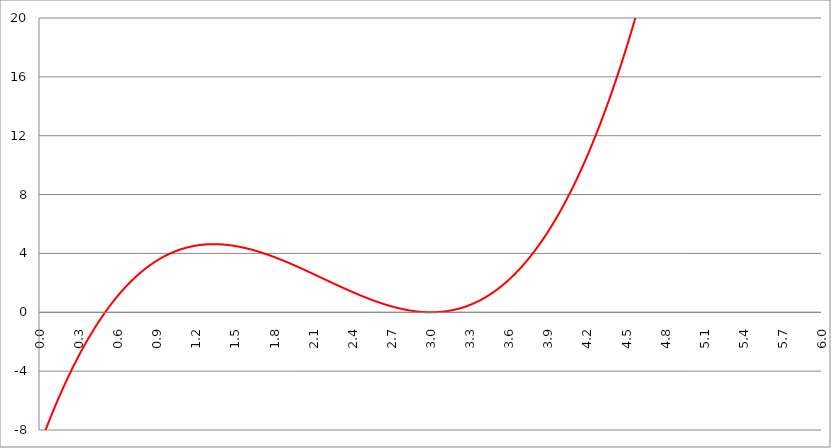
| Category | Series 1 | Series 0 | Series 2 |
|---|---|---|---|
| 0.0 | -9 |  |  |
| 0.003 | -8.928 |  |  |
| 0.006 | -8.856 |  |  |
| 0.009 | -8.785 |  |  |
| 0.012 | -8.714 |  |  |
| 0.015 | -8.643 |  |  |
| 0.018 | -8.572 |  |  |
| 0.021 | -8.502 |  |  |
| 0.024 | -8.431 |  |  |
| 0.027 | -8.361 |  |  |
| 0.03 | -8.292 |  |  |
| 0.033 | -8.222 |  |  |
| 0.036 | -8.153 |  |  |
| 0.039 | -8.084 |  |  |
| 0.042 | -8.015 |  |  |
| 0.045 | -7.946 |  |  |
| 0.048 | -7.878 |  |  |
| 0.051 | -7.81 |  |  |
| 0.054 | -7.742 |  |  |
| 0.057 | -7.674 |  |  |
| 0.06 | -7.606 |  |  |
| 0.063 | -7.539 |  |  |
| 0.066 | -7.472 |  |  |
| 0.069 | -7.405 |  |  |
| 0.072 | -7.339 |  |  |
| 0.075 | -7.272 |  |  |
| 0.078 | -7.206 |  |  |
| 0.081 | -7.14 |  |  |
| 0.084 | -7.075 |  |  |
| 0.087 | -7.009 |  |  |
| 0.09 | -6.944 |  |  |
| 0.093 | -6.879 |  |  |
| 0.096 | -6.814 |  |  |
| 0.099 | -6.749 |  |  |
| 0.102 | -6.685 |  |  |
| 0.105 | -6.621 |  |  |
| 0.108 | -6.557 |  |  |
| 0.111 | -6.493 |  |  |
| 0.114 | -6.43 |  |  |
| 0.117 | -6.367 |  |  |
| 0.12 | -6.304 |  |  |
| 0.123 | -6.241 |  |  |
| 0.126 | -6.178 |  |  |
| 0.129 | -6.116 |  |  |
| 0.132 | -6.054 |  |  |
| 0.135 | -5.992 |  |  |
| 0.138 | -5.93 |  |  |
| 0.141 | -5.869 |  |  |
| 0.144 | -5.808 |  |  |
| 0.147 | -5.747 |  |  |
| 0.15 | -5.686 |  |  |
| 0.153 | -5.625 |  |  |
| 0.156 | -5.565 |  |  |
| 0.159 | -5.505 |  |  |
| 0.162 | -5.445 |  |  |
| 0.165 | -5.385 |  |  |
| 0.168 | -5.325 |  |  |
| 0.171 | -5.266 |  |  |
| 0.174 | -5.207 |  |  |
| 0.177 | -5.148 |  |  |
| 0.18 | -5.09 |  |  |
| 0.183 | -5.031 |  |  |
| 0.186 | -4.973 |  |  |
| 0.189 | -4.915 |  |  |
| 0.192 | -4.857 |  |  |
| 0.195 | -4.799 |  |  |
| 0.198 | -4.742 |  |  |
| 0.201 | -4.685 |  |  |
| 0.204 | -4.628 |  |  |
| 0.207 | -4.571 |  |  |
| 0.21 | -4.515 |  |  |
| 0.213 | -4.458 |  |  |
| 0.216 | -4.402 |  |  |
| 0.219 | -4.346 |  |  |
| 0.222 | -4.291 |  |  |
| 0.225 | -4.235 |  |  |
| 0.228 | -4.18 |  |  |
| 0.231 | -4.125 |  |  |
| 0.234 | -4.07 |  |  |
| 0.237 | -4.016 |  |  |
| 0.24 | -3.961 |  |  |
| 0.243 | -3.907 |  |  |
| 0.246 | -3.853 |  |  |
| 0.249 | -3.799 |  |  |
| 0.252 | -3.746 |  |  |
| 0.255 | -3.692 |  |  |
| 0.258 | -3.639 |  |  |
| 0.261 | -3.586 |  |  |
| 0.264 | -3.533 |  |  |
| 0.267 | -3.481 |  |  |
| 0.27 | -3.428 |  |  |
| 0.273 | -3.376 |  |  |
| 0.276 | -3.324 |  |  |
| 0.279 | -3.272 |  |  |
| 0.282 | -3.221 |  |  |
| 0.285 | -3.17 |  |  |
| 0.288 | -3.118 |  |  |
| 0.291 | -3.068 |  |  |
| 0.294 | -3.017 |  |  |
| 0.297 | -2.966 |  |  |
| 0.3 | -2.916 |  |  |
| 0.303 | -2.866 |  |  |
| 0.306 | -2.816 |  |  |
| 0.309 | -2.766 |  |  |
| 0.312 | -2.717 |  |  |
| 0.315 | -2.667 |  |  |
| 0.318 | -2.618 |  |  |
| 0.321 | -2.569 |  |  |
| 0.324 | -2.521 |  |  |
| 0.327 | -2.472 |  |  |
| 0.33 | -2.424 |  |  |
| 0.333 | -2.376 |  |  |
| 0.336 | -2.328 |  |  |
| 0.339 | -2.28 |  |  |
| 0.342 | -2.233 |  |  |
| 0.345 | -2.185 |  |  |
| 0.348 | -2.138 |  |  |
| 0.351 | -2.091 |  |  |
| 0.354 | -2.044 |  |  |
| 0.357 | -1.998 |  |  |
| 0.36 | -1.951 |  |  |
| 0.363 | -1.905 |  |  |
| 0.366 | -1.859 |  |  |
| 0.369 | -1.814 |  |  |
| 0.372 | -1.768 |  |  |
| 0.375 | -1.723 |  |  |
| 0.378 | -1.677 |  |  |
| 0.381 | -1.632 |  |  |
| 0.384 | -1.588 |  |  |
| 0.387 | -1.543 |  |  |
| 0.39 | -1.499 |  |  |
| 0.393 | -1.454 |  |  |
| 0.396 | -1.41 |  |  |
| 0.399 | -1.367 |  |  |
| 0.402 | -1.323 |  |  |
| 0.405 | -1.279 |  |  |
| 0.408 | -1.236 |  |  |
| 0.411 | -1.193 |  |  |
| 0.414 | -1.15 |  |  |
| 0.417 | -1.108 |  |  |
| 0.42 | -1.065 |  |  |
| 0.423 | -1.023 |  |  |
| 0.426 | -0.981 |  |  |
| 0.429 | -0.939 |  |  |
| 0.432 | -0.897 |  |  |
| 0.435 | -0.855 |  |  |
| 0.438 | -0.814 |  |  |
| 0.441 | -0.773 |  |  |
| 0.444 | -0.732 |  |  |
| 0.447 | -0.691 |  |  |
| 0.45 | -0.65 |  |  |
| 0.453 | -0.61 |  |  |
| 0.456 | -0.57 |  |  |
| 0.459 | -0.529 |  |  |
| 0.462 | -0.49 |  |  |
| 0.465 | -0.45 |  |  |
| 0.468 | -0.41 |  |  |
| 0.471 | -0.371 |  |  |
| 0.474 | -0.332 |  |  |
| 0.477 | -0.293 |  |  |
| 0.48 | -0.254 |  |  |
| 0.483 | -0.215 |  |  |
| 0.486 | -0.177 |  |  |
| 0.489 | -0.139 |  |  |
| 0.492 | -0.101 |  |  |
| 0.495 | -0.063 |  |  |
| 0.498 | -0.025 |  |  |
| 0.501 | 0.012 |  |  |
| 0.504 | 0.05 |  |  |
| 0.507 | 0.087 |  |  |
| 0.51 | 0.124 |  |  |
| 0.513 | 0.161 |  |  |
| 0.516 | 0.197 |  |  |
| 0.519 | 0.234 |  |  |
| 0.522 | 0.27 |  |  |
| 0.525 | 0.306 |  |  |
| 0.528 | 0.342 |  |  |
| 0.531 | 0.378 |  |  |
| 0.534 | 0.414 |  |  |
| 0.537 | 0.449 |  |  |
| 0.54 | 0.484 |  |  |
| 0.543 | 0.519 |  |  |
| 0.546 | 0.554 |  |  |
| 0.549 | 0.589 |  |  |
| 0.552 | 0.623 |  |  |
| 0.555 | 0.658 |  |  |
| 0.558 | 0.692 |  |  |
| 0.561 | 0.726 |  |  |
| 0.564 | 0.76 |  |  |
| 0.567 | 0.793 |  |  |
| 0.57 | 0.827 |  |  |
| 0.573 | 0.86 |  |  |
| 0.576 | 0.893 |  |  |
| 0.579 | 0.926 |  |  |
| 0.582 | 0.959 |  |  |
| 0.585 | 0.991 |  |  |
| 0.588 | 1.024 |  |  |
| 0.591 | 1.056 |  |  |
| 0.594 | 1.088 |  |  |
| 0.597 | 1.12 |  |  |
| 0.6 | 1.152 |  |  |
| 0.603 | 1.184 |  |  |
| 0.606 | 1.215 |  |  |
| 0.609 | 1.246 |  |  |
| 0.612 | 1.277 |  |  |
| 0.615 | 1.308 |  |  |
| 0.618 | 1.339 |  |  |
| 0.621 | 1.37 |  |  |
| 0.624 | 1.4 |  |  |
| 0.627 | 1.43 |  |  |
| 0.63 | 1.46 |  |  |
| 0.633 | 1.49 |  |  |
| 0.636 | 1.52 |  |  |
| 0.639 | 1.55 |  |  |
| 0.642 | 1.579 |  |  |
| 0.645 | 1.608 |  |  |
| 0.648 | 1.637 |  |  |
| 0.651 | 1.666 |  |  |
| 0.654 | 1.695 |  |  |
| 0.657 | 1.724 |  |  |
| 0.66 | 1.752 |  |  |
| 0.663 | 1.78 |  |  |
| 0.666 | 1.809 |  |  |
| 0.669 | 1.837 |  |  |
| 0.672 | 1.864 |  |  |
| 0.675 | 1.892 |  |  |
| 0.678 | 1.919 |  |  |
| 0.681 | 1.947 |  |  |
| 0.684 | 1.974 |  |  |
| 0.687 | 2.001 |  |  |
| 0.69 | 2.028 |  |  |
| 0.693 | 2.054 |  |  |
| 0.696 | 2.081 |  |  |
| 0.699 | 2.107 |  |  |
| 0.702 | 2.133 |  |  |
| 0.705 | 2.159 |  |  |
| 0.708 | 2.185 |  |  |
| 0.711 | 2.211 |  |  |
| 0.714 | 2.237 |  |  |
| 0.717 | 2.262 |  |  |
| 0.72 | 2.287 |  |  |
| 0.723 | 2.312 |  |  |
| 0.726 | 2.337 |  |  |
| 0.729 | 2.362 |  |  |
| 0.732 | 2.387 |  |  |
| 0.735 | 2.411 |  |  |
| 0.738 | 2.436 |  |  |
| 0.741 | 2.46 |  |  |
| 0.744 | 2.484 |  |  |
| 0.747 | 2.508 |  |  |
| 0.75 | 2.531 |  |  |
| 0.753 | 2.555 |  |  |
| 0.756 | 2.578 |  |  |
| 0.759 | 2.601 |  |  |
| 0.762 | 2.625 |  |  |
| 0.765 | 2.647 |  |  |
| 0.768 | 2.67 |  |  |
| 0.771000000000001 | 2.693 |  |  |
| 0.774000000000001 | 2.715 |  |  |
| 0.777000000000001 | 2.738 |  |  |
| 0.78 | 2.76 |  |  |
| 0.783000000000001 | 2.782 |  |  |
| 0.786000000000001 | 2.804 |  |  |
| 0.789000000000001 | 2.826 |  |  |
| 0.792000000000001 | 2.847 |  |  |
| 0.795000000000001 | 2.869 |  |  |
| 0.798000000000001 | 2.89 |  |  |
| 0.801000000000001 | 2.911 |  |  |
| 0.804000000000001 | 2.932 |  |  |
| 0.807000000000001 | 2.953 |  |  |
| 0.810000000000001 | 2.974 |  |  |
| 0.813000000000001 | 2.994 |  |  |
| 0.816000000000001 | 3.015 |  |  |
| 0.819000000000001 | 3.035 |  |  |
| 0.822000000000001 | 3.055 |  |  |
| 0.825000000000001 | 3.075 |  |  |
| 0.828000000000001 | 3.095 |  |  |
| 0.831000000000001 | 3.114 |  |  |
| 0.834000000000001 | 3.134 |  |  |
| 0.837000000000001 | 3.153 |  |  |
| 0.840000000000001 | 3.173 |  |  |
| 0.843000000000001 | 3.192 |  |  |
| 0.846000000000001 | 3.211 |  |  |
| 0.849000000000001 | 3.23 |  |  |
| 0.852000000000001 | 3.248 |  |  |
| 0.855000000000001 | 3.267 |  |  |
| 0.858000000000001 | 3.285 |  |  |
| 0.861000000000001 | 3.303 |  |  |
| 0.864000000000001 | 3.321 |  |  |
| 0.867000000000001 | 3.339 |  |  |
| 0.870000000000001 | 3.357 |  |  |
| 0.873000000000001 | 3.375 |  |  |
| 0.876000000000001 | 3.393 |  |  |
| 0.879000000000001 | 3.41 |  |  |
| 0.882000000000001 | 3.427 |  |  |
| 0.885000000000001 | 3.444 |  |  |
| 0.888000000000001 | 3.461 |  |  |
| 0.891000000000001 | 3.478 |  |  |
| 0.894000000000001 | 3.495 |  |  |
| 0.897000000000001 | 3.512 |  |  |
| 0.900000000000001 | 3.528 |  |  |
| 0.903000000000001 | 3.544 |  |  |
| 0.906000000000001 | 3.56 |  |  |
| 0.909000000000001 | 3.577 |  |  |
| 0.912000000000001 | 3.592 |  |  |
| 0.915000000000001 | 3.608 |  |  |
| 0.918000000000001 | 3.624 |  |  |
| 0.921000000000001 | 3.639 |  |  |
| 0.924000000000001 | 3.655 |  |  |
| 0.927000000000001 | 3.67 |  |  |
| 0.930000000000001 | 3.685 |  |  |
| 0.933000000000001 | 3.7 |  |  |
| 0.936000000000001 | 3.715 |  |  |
| 0.939000000000001 | 3.729 |  |  |
| 0.942000000000001 | 3.744 |  |  |
| 0.945000000000001 | 3.758 |  |  |
| 0.948000000000001 | 3.773 |  |  |
| 0.951000000000001 | 3.787 |  |  |
| 0.954000000000001 | 3.801 |  |  |
| 0.957000000000001 | 3.815 |  |  |
| 0.960000000000001 | 3.829 |  |  |
| 0.963000000000001 | 3.842 |  |  |
| 0.966000000000001 | 3.856 |  |  |
| 0.969000000000001 | 3.869 |  |  |
| 0.972000000000001 | 3.882 |  |  |
| 0.975000000000001 | 3.896 |  |  |
| 0.978000000000001 | 3.909 |  |  |
| 0.981000000000001 | 3.921 |  |  |
| 0.984000000000001 | 3.934 |  |  |
| 0.987000000000001 | 3.947 |  |  |
| 0.990000000000001 | 3.959 |  |  |
| 0.993000000000001 | 3.972 |  |  |
| 0.996000000000001 | 3.984 |  |  |
| 0.999000000000001 | 3.996 |  |  |
| 1.002000000000001 | 4.008 |  |  |
| 1.005000000000001 | 4.02 |  |  |
| 1.008 | 4.032 |  |  |
| 1.011 | 4.043 |  |  |
| 1.014 | 4.055 |  |  |
| 1.017 | 4.066 |  |  |
| 1.02 | 4.077 |  |  |
| 1.023 | 4.088 |  |  |
| 1.026 | 4.099 |  |  |
| 1.029 | 4.11 |  |  |
| 1.032 | 4.121 |  |  |
| 1.034999999999999 | 4.132 |  |  |
| 1.037999999999999 | 4.142 |  |  |
| 1.040999999999999 | 4.152 |  |  |
| 1.043999999999999 | 4.163 |  |  |
| 1.046999999999999 | 4.173 |  |  |
| 1.049999999999999 | 4.183 |  |  |
| 1.052999999999999 | 4.193 |  |  |
| 1.055999999999999 | 4.202 |  |  |
| 1.058999999999999 | 4.212 |  |  |
| 1.061999999999998 | 4.222 |  |  |
| 1.064999999999998 | 4.231 |  |  |
| 1.067999999999998 | 4.24 |  |  |
| 1.070999999999998 | 4.249 |  |  |
| 1.073999999999998 | 4.258 |  |  |
| 1.076999999999998 | 4.267 |  |  |
| 1.079999999999998 | 4.276 |  |  |
| 1.082999999999998 | 4.285 |  |  |
| 1.085999999999998 | 4.294 |  |  |
| 1.088999999999998 | 4.302 |  |  |
| 1.091999999999997 | 4.31 |  |  |
| 1.094999999999997 | 4.319 |  |  |
| 1.097999999999997 | 4.327 |  |  |
| 1.100999999999997 | 4.335 |  |  |
| 1.103999999999997 | 4.343 |  |  |
| 1.106999999999997 | 4.35 |  |  |
| 1.109999999999997 | 4.358 |  |  |
| 1.112999999999997 | 4.366 |  |  |
| 1.115999999999997 | 4.373 |  |  |
| 1.118999999999996 | 4.38 |  |  |
| 1.121999999999996 | 4.387 |  |  |
| 1.124999999999996 | 4.395 |  |  |
| 1.127999999999996 | 4.402 |  |  |
| 1.130999999999996 | 4.408 |  |  |
| 1.133999999999996 | 4.415 |  |  |
| 1.136999999999996 | 4.422 |  |  |
| 1.139999999999996 | 4.428 |  |  |
| 1.142999999999996 | 4.435 |  |  |
| 1.145999999999995 | 4.441 |  |  |
| 1.148999999999995 | 4.447 |  |  |
| 1.151999999999995 | 4.453 |  |  |
| 1.154999999999995 | 4.459 |  |  |
| 1.157999999999995 | 4.465 |  |  |
| 1.160999999999995 | 4.471 |  |  |
| 1.163999999999995 | 4.477 |  |  |
| 1.166999999999995 | 4.482 |  |  |
| 1.169999999999995 | 4.488 |  |  |
| 1.172999999999994 | 4.493 |  |  |
| 1.175999999999994 | 4.498 |  |  |
| 1.178999999999994 | 4.503 |  |  |
| 1.181999999999994 | 4.508 |  |  |
| 1.184999999999994 | 4.513 |  |  |
| 1.187999999999994 | 4.518 |  |  |
| 1.190999999999994 | 4.523 |  |  |
| 1.193999999999994 | 4.527 |  |  |
| 1.196999999999994 | 4.532 |  |  |
| 1.199999999999993 | 4.536 |  |  |
| 1.202999999999993 | 4.54 |  |  |
| 1.205999999999993 | 4.544 |  |  |
| 1.208999999999993 | 4.548 |  |  |
| 1.211999999999993 | 4.552 |  |  |
| 1.214999999999993 | 4.556 |  |  |
| 1.217999999999993 | 4.56 |  |  |
| 1.220999999999993 | 4.564 |  |  |
| 1.223999999999993 | 4.567 |  |  |
| 1.226999999999993 | 4.571 |  |  |
| 1.229999999999992 | 4.574 |  |  |
| 1.232999999999992 | 4.577 |  |  |
| 1.235999999999992 | 4.58 |  |  |
| 1.238999999999992 | 4.583 |  |  |
| 1.241999999999992 | 4.586 |  |  |
| 1.244999999999992 | 4.589 |  |  |
| 1.247999999999992 | 4.592 |  |  |
| 1.250999999999992 | 4.595 |  |  |
| 1.253999999999992 | 4.597 |  |  |
| 1.256999999999991 | 4.6 |  |  |
| 1.259999999999991 | 4.602 |  |  |
| 1.262999999999991 | 4.604 |  |  |
| 1.265999999999991 | 4.606 |  |  |
| 1.268999999999991 | 4.608 |  |  |
| 1.271999999999991 | 4.61 |  |  |
| 1.274999999999991 | 4.612 |  |  |
| 1.277999999999991 | 4.614 |  |  |
| 1.280999999999991 | 4.616 |  |  |
| 1.28399999999999 | 4.617 |  |  |
| 1.28699999999999 | 4.619 |  |  |
| 1.28999999999999 | 4.62 |  |  |
| 1.29299999999999 | 4.621 |  |  |
| 1.29599999999999 | 4.623 |  |  |
| 1.29899999999999 | 4.624 |  |  |
| 1.30199999999999 | 4.625 |  |  |
| 1.30499999999999 | 4.626 |  |  |
| 1.30799999999999 | 4.626 |  |  |
| 1.310999999999989 | 4.627 |  |  |
| 1.313999999999989 | 4.628 |  |  |
| 1.316999999999989 | 4.628 |  |  |
| 1.319999999999989 | 4.629 |  |  |
| 1.322999999999989 | 4.629 |  |  |
| 1.325999999999989 | 4.629 |  |  |
| 1.328999999999989 | 4.63 |  |  |
| 1.331999999999989 | 4.63 |  |  |
| 1.334999999999989 | 4.63 |  |  |
| 1.337999999999988 | 4.63 |  |  |
| 1.340999999999988 | 4.629 |  |  |
| 1.343999999999988 | 4.629 |  |  |
| 1.346999999999988 | 4.629 |  |  |
| 1.349999999999988 | 4.628 |  |  |
| 1.352999999999988 | 4.628 |  |  |
| 1.355999999999988 | 4.627 |  |  |
| 1.358999999999988 | 4.626 |  |  |
| 1.361999999999988 | 4.626 |  |  |
| 1.364999999999987 | 4.625 |  |  |
| 1.367999999999987 | 4.624 |  |  |
| 1.370999999999987 | 4.623 |  |  |
| 1.373999999999987 | 4.621 |  |  |
| 1.376999999999987 | 4.62 |  |  |
| 1.379999999999987 | 4.619 |  |  |
| 1.382999999999987 | 4.618 |  |  |
| 1.385999999999987 | 4.616 |  |  |
| 1.388999999999987 | 4.614 |  |  |
| 1.391999999999987 | 4.613 |  |  |
| 1.394999999999986 | 4.611 |  |  |
| 1.397999999999986 | 4.609 |  |  |
| 1.400999999999986 | 4.607 |  |  |
| 1.403999999999986 | 4.605 |  |  |
| 1.406999999999986 | 4.603 |  |  |
| 1.409999999999986 | 4.601 |  |  |
| 1.412999999999986 | 4.599 |  |  |
| 1.415999999999986 | 4.597 |  |  |
| 1.418999999999986 | 4.594 |  |  |
| 1.421999999999985 | 4.592 |  |  |
| 1.424999999999985 | 4.589 |  |  |
| 1.427999999999985 | 4.587 |  |  |
| 1.430999999999985 | 4.584 |  |  |
| 1.433999999999985 | 4.581 |  |  |
| 1.436999999999985 | 4.578 |  |  |
| 1.439999999999985 | 4.575 |  |  |
| 1.442999999999985 | 4.572 |  |  |
| 1.445999999999985 | 4.569 |  |  |
| 1.448999999999984 | 4.566 |  |  |
| 1.451999999999984 | 4.563 |  |  |
| 1.454999999999984 | 4.559 |  |  |
| 1.457999999999984 | 4.556 |  |  |
| 1.460999999999984 | 4.552 |  |  |
| 1.463999999999984 | 4.549 |  |  |
| 1.466999999999984 | 4.545 |  |  |
| 1.469999999999984 | 4.541 |  |  |
| 1.472999999999984 | 4.538 |  |  |
| 1.475999999999984 | 4.534 |  |  |
| 1.478999999999983 | 4.53 |  |  |
| 1.481999999999983 | 4.526 |  |  |
| 1.484999999999983 | 4.522 |  |  |
| 1.487999999999983 | 4.517 |  |  |
| 1.490999999999983 | 4.513 |  |  |
| 1.493999999999983 | 4.509 |  |  |
| 1.496999999999983 | 4.504 |  |  |
| 1.499999999999983 | 4.5 |  |  |
| 1.502999999999983 | 4.495 |  |  |
| 1.505999999999982 | 4.491 |  |  |
| 1.508999999999982 | 4.486 |  |  |
| 1.511999999999982 | 4.481 |  |  |
| 1.514999999999982 | 4.477 |  |  |
| 1.517999999999982 | 4.472 |  |  |
| 1.520999999999982 | 4.467 |  |  |
| 1.523999999999982 | 4.462 |  |  |
| 1.526999999999982 | 4.457 |  |  |
| 1.529999999999982 | 4.451 |  |  |
| 1.532999999999981 | 4.446 |  |  |
| 1.535999999999981 | 4.441 |  |  |
| 1.538999999999981 | 4.436 |  |  |
| 1.541999999999981 | 4.43 |  |  |
| 1.544999999999981 | 4.425 |  |  |
| 1.547999999999981 | 4.419 |  |  |
| 1.550999999999981 | 4.413 |  |  |
| 1.553999999999981 | 4.408 |  |  |
| 1.556999999999981 | 4.402 |  |  |
| 1.559999999999981 | 4.396 |  |  |
| 1.56299999999998 | 4.39 |  |  |
| 1.56599999999998 | 4.384 |  |  |
| 1.56899999999998 | 4.378 |  |  |
| 1.57199999999998 | 4.372 |  |  |
| 1.57499999999998 | 4.366 |  |  |
| 1.57799999999998 | 4.36 |  |  |
| 1.58099999999998 | 4.353 |  |  |
| 1.58399999999998 | 4.347 |  |  |
| 1.58699999999998 | 4.341 |  |  |
| 1.589999999999979 | 4.334 |  |  |
| 1.592999999999979 | 4.328 |  |  |
| 1.595999999999979 | 4.321 |  |  |
| 1.598999999999979 | 4.314 |  |  |
| 1.601999999999979 | 4.308 |  |  |
| 1.604999999999979 | 4.301 |  |  |
| 1.607999999999979 | 4.294 |  |  |
| 1.610999999999979 | 4.287 |  |  |
| 1.613999999999978 | 4.28 |  |  |
| 1.616999999999978 | 4.273 |  |  |
| 1.619999999999978 | 4.266 |  |  |
| 1.622999999999978 | 4.259 |  |  |
| 1.625999999999978 | 4.251 |  |  |
| 1.628999999999978 | 4.244 |  |  |
| 1.631999999999978 | 4.237 |  |  |
| 1.634999999999978 | 4.23 |  |  |
| 1.637999999999978 | 4.222 |  |  |
| 1.640999999999977 | 4.215 |  |  |
| 1.643999999999977 | 4.207 |  |  |
| 1.646999999999977 | 4.199 |  |  |
| 1.649999999999977 | 4.192 |  |  |
| 1.652999999999977 | 4.184 |  |  |
| 1.655999999999977 | 4.176 |  |  |
| 1.658999999999977 | 4.168 |  |  |
| 1.661999999999977 | 4.161 |  |  |
| 1.664999999999977 | 4.153 |  |  |
| 1.667999999999977 | 4.145 |  |  |
| 1.670999999999976 | 4.137 |  |  |
| 1.673999999999976 | 4.128 |  |  |
| 1.676999999999976 | 4.12 |  |  |
| 1.679999999999976 | 4.112 |  |  |
| 1.682999999999976 | 4.104 |  |  |
| 1.685999999999976 | 4.095 |  |  |
| 1.688999999999976 | 4.087 |  |  |
| 1.691999999999976 | 4.079 |  |  |
| 1.694999999999976 | 4.07 |  |  |
| 1.697999999999975 | 4.062 |  |  |
| 1.700999999999975 | 4.053 |  |  |
| 1.703999999999975 | 4.045 |  |  |
| 1.706999999999975 | 4.036 |  |  |
| 1.709999999999975 | 4.027 |  |  |
| 1.712999999999975 | 4.018 |  |  |
| 1.715999999999975 | 4.01 |  |  |
| 1.718999999999975 | 4.001 |  |  |
| 1.721999999999975 | 3.992 |  |  |
| 1.724999999999974 | 3.983 |  |  |
| 1.727999999999974 | 3.974 |  |  |
| 1.730999999999974 | 3.965 |  |  |
| 1.733999999999974 | 3.956 |  |  |
| 1.736999999999974 | 3.946 |  |  |
| 1.739999999999974 | 3.937 |  |  |
| 1.742999999999974 | 3.928 |  |  |
| 1.745999999999974 | 3.919 |  |  |
| 1.748999999999974 | 3.909 |  |  |
| 1.751999999999974 | 3.9 |  |  |
| 1.754999999999973 | 3.891 |  |  |
| 1.757999999999973 | 3.881 |  |  |
| 1.760999999999973 | 3.872 |  |  |
| 1.763999999999973 | 3.862 |  |  |
| 1.766999999999973 | 3.852 |  |  |
| 1.769999999999973 | 3.843 |  |  |
| 1.772999999999973 | 3.833 |  |  |
| 1.775999999999973 | 3.823 |  |  |
| 1.778999999999973 | 3.814 |  |  |
| 1.781999999999972 | 3.804 |  |  |
| 1.784999999999972 | 3.794 |  |  |
| 1.787999999999972 | 3.784 |  |  |
| 1.790999999999972 | 3.774 |  |  |
| 1.793999999999972 | 3.764 |  |  |
| 1.796999999999972 | 3.754 |  |  |
| 1.799999999999972 | 3.744 |  |  |
| 1.802999999999972 | 3.734 |  |  |
| 1.805999999999972 | 3.724 |  |  |
| 1.808999999999971 | 3.714 |  |  |
| 1.811999999999971 | 3.703 |  |  |
| 1.814999999999971 | 3.693 |  |  |
| 1.817999999999971 | 3.683 |  |  |
| 1.820999999999971 | 3.672 |  |  |
| 1.823999999999971 | 3.662 |  |  |
| 1.826999999999971 | 3.652 |  |  |
| 1.829999999999971 | 3.641 |  |  |
| 1.832999999999971 | 3.631 |  |  |
| 1.83599999999997 | 3.62 |  |  |
| 1.83899999999997 | 3.61 |  |  |
| 1.84199999999997 | 3.599 |  |  |
| 1.84499999999997 | 3.589 |  |  |
| 1.84799999999997 | 3.578 |  |  |
| 1.85099999999997 | 3.567 |  |  |
| 1.85399999999997 | 3.556 |  |  |
| 1.85699999999997 | 3.546 |  |  |
| 1.85999999999997 | 3.535 |  |  |
| 1.86299999999997 | 3.524 |  |  |
| 1.865999999999969 | 3.513 |  |  |
| 1.868999999999969 | 3.502 |  |  |
| 1.871999999999969 | 3.491 |  |  |
| 1.874999999999969 | 3.48 |  |  |
| 1.877999999999969 | 3.469 |  |  |
| 1.880999999999969 | 3.458 |  |  |
| 1.883999999999969 | 3.447 |  |  |
| 1.886999999999969 | 3.436 |  |  |
| 1.889999999999969 | 3.425 |  |  |
| 1.892999999999968 | 3.414 |  |  |
| 1.895999999999968 | 3.403 |  |  |
| 1.898999999999968 | 3.392 |  |  |
| 1.901999999999968 | 3.381 |  |  |
| 1.904999999999968 | 3.369 |  |  |
| 1.907999999999968 | 3.358 |  |  |
| 1.910999999999968 | 3.347 |  |  |
| 1.913999999999968 | 3.335 |  |  |
| 1.916999999999968 | 3.324 |  |  |
| 1.919999999999967 | 3.313 |  |  |
| 1.922999999999967 | 3.301 |  |  |
| 1.925999999999967 | 3.29 |  |  |
| 1.928999999999967 | 3.278 |  |  |
| 1.931999999999967 | 3.267 |  |  |
| 1.934999999999967 | 3.255 |  |  |
| 1.937999999999967 | 3.244 |  |  |
| 1.940999999999967 | 3.232 |  |  |
| 1.943999999999967 | 3.221 |  |  |
| 1.946999999999967 | 3.209 |  |  |
| 1.949999999999966 | 3.197 |  |  |
| 1.952999999999966 | 3.186 |  |  |
| 1.955999999999966 | 3.174 |  |  |
| 1.958999999999966 | 3.162 |  |  |
| 1.961999999999966 | 3.15 |  |  |
| 1.964999999999966 | 3.139 |  |  |
| 1.967999999999966 | 3.127 |  |  |
| 1.970999999999966 | 3.115 |  |  |
| 1.973999999999966 | 3.103 |  |  |
| 1.976999999999965 | 3.091 |  |  |
| 1.979999999999965 | 3.08 |  |  |
| 1.982999999999965 | 3.068 |  |  |
| 1.985999999999965 | 3.056 |  |  |
| 1.988999999999965 | 3.044 |  |  |
| 1.991999999999965 | 3.032 |  |  |
| 1.994999999999965 | 3.02 |  |  |
| 1.997999999999965 | 3.008 |  |  |
| 2.000999999999965 | 2.996 |  |  |
| 2.003999999999965 | 2.984 |  |  |
| 2.006999999999965 | 2.972 |  |  |
| 2.009999999999965 | 2.96 |  |  |
| 2.012999999999965 | 2.948 |  |  |
| 2.015999999999965 | 2.936 |  |  |
| 2.018999999999965 | 2.924 |  |  |
| 2.021999999999966 | 2.912 |  |  |
| 2.024999999999966 | 2.899 |  |  |
| 2.027999999999966 | 2.887 |  |  |
| 2.030999999999966 | 2.875 |  |  |
| 2.033999999999966 | 2.863 |  |  |
| 2.036999999999966 | 2.851 |  |  |
| 2.039999999999966 | 2.839 |  |  |
| 2.042999999999966 | 2.826 |  |  |
| 2.045999999999967 | 2.814 |  |  |
| 2.048999999999967 | 2.802 |  |  |
| 2.051999999999967 | 2.79 |  |  |
| 2.054999999999967 | 2.777 |  |  |
| 2.057999999999967 | 2.765 |  |  |
| 2.060999999999967 | 2.753 |  |  |
| 2.063999999999967 | 2.74 |  |  |
| 2.066999999999967 | 2.728 |  |  |
| 2.069999999999967 | 2.716 |  |  |
| 2.072999999999968 | 2.703 |  |  |
| 2.075999999999968 | 2.691 |  |  |
| 2.078999999999968 | 2.679 |  |  |
| 2.081999999999968 | 2.666 |  |  |
| 2.084999999999968 | 2.654 |  |  |
| 2.087999999999968 | 2.642 |  |  |
| 2.090999999999968 | 2.629 |  |  |
| 2.093999999999968 | 2.617 |  |  |
| 2.096999999999968 | 2.604 |  |  |
| 2.099999999999969 | 2.592 |  |  |
| 2.102999999999969 | 2.58 |  |  |
| 2.105999999999969 | 2.567 |  |  |
| 2.108999999999969 | 2.555 |  |  |
| 2.111999999999969 | 2.542 |  |  |
| 2.114999999999969 | 2.53 |  |  |
| 2.117999999999969 | 2.517 |  |  |
| 2.120999999999969 | 2.505 |  |  |
| 2.123999999999969 | 2.492 |  |  |
| 2.12699999999997 | 2.48 |  |  |
| 2.12999999999997 | 2.467 |  |  |
| 2.13299999999997 | 2.455 |  |  |
| 2.13599999999997 | 2.443 |  |  |
| 2.13899999999997 | 2.43 |  |  |
| 2.14199999999997 | 2.418 |  |  |
| 2.14499999999997 | 2.405 |  |  |
| 2.14799999999997 | 2.393 |  |  |
| 2.15099999999997 | 2.38 |  |  |
| 2.153999999999971 | 2.368 |  |  |
| 2.156999999999971 | 2.355 |  |  |
| 2.159999999999971 | 2.343 |  |  |
| 2.162999999999971 | 2.33 |  |  |
| 2.165999999999971 | 2.318 |  |  |
| 2.168999999999971 | 2.305 |  |  |
| 2.171999999999971 | 2.293 |  |  |
| 2.174999999999971 | 2.28 |  |  |
| 2.177999999999971 | 2.268 |  |  |
| 2.180999999999972 | 2.255 |  |  |
| 2.183999999999972 | 2.243 |  |  |
| 2.186999999999972 | 2.23 |  |  |
| 2.189999999999972 | 2.218 |  |  |
| 2.192999999999972 | 2.205 |  |  |
| 2.195999999999972 | 2.193 |  |  |
| 2.198999999999972 | 2.18 |  |  |
| 2.201999999999972 | 2.168 |  |  |
| 2.204999999999972 | 2.155 |  |  |
| 2.207999999999972 | 2.143 |  |  |
| 2.210999999999973 | 2.13 |  |  |
| 2.213999999999973 | 2.118 |  |  |
| 2.216999999999973 | 2.105 |  |  |
| 2.219999999999973 | 2.093 |  |  |
| 2.222999999999973 | 2.08 |  |  |
| 2.225999999999973 | 2.068 |  |  |
| 2.228999999999973 | 2.056 |  |  |
| 2.231999999999974 | 2.043 |  |  |
| 2.234999999999974 | 2.031 |  |  |
| 2.237999999999974 | 2.018 |  |  |
| 2.240999999999974 | 2.006 |  |  |
| 2.243999999999974 | 1.994 |  |  |
| 2.246999999999974 | 1.981 |  |  |
| 2.249999999999974 | 1.969 |  |  |
| 2.252999999999974 | 1.956 |  |  |
| 2.255999999999974 | 1.944 |  |  |
| 2.258999999999975 | 1.932 |  |  |
| 2.261999999999975 | 1.919 |  |  |
| 2.264999999999975 | 1.907 |  |  |
| 2.267999999999975 | 1.895 |  |  |
| 2.270999999999975 | 1.882 |  |  |
| 2.273999999999975 | 1.87 |  |  |
| 2.276999999999975 | 1.858 |  |  |
| 2.279999999999975 | 1.846 |  |  |
| 2.282999999999975 | 1.833 |  |  |
| 2.285999999999976 | 1.821 |  |  |
| 2.288999999999976 | 1.809 |  |  |
| 2.291999999999976 | 1.797 |  |  |
| 2.294999999999976 | 1.784 |  |  |
| 2.297999999999976 | 1.772 |  |  |
| 2.300999999999976 | 1.76 |  |  |
| 2.303999999999976 | 1.748 |  |  |
| 2.306999999999976 | 1.736 |  |  |
| 2.309999999999976 | 1.723 |  |  |
| 2.312999999999977 | 1.711 |  |  |
| 2.315999999999977 | 1.699 |  |  |
| 2.318999999999977 | 1.687 |  |  |
| 2.321999999999977 | 1.675 |  |  |
| 2.324999999999977 | 1.663 |  |  |
| 2.327999999999977 | 1.651 |  |  |
| 2.330999999999977 | 1.639 |  |  |
| 2.333999999999977 | 1.627 |  |  |
| 2.336999999999977 | 1.615 |  |  |
| 2.339999999999978 | 1.603 |  |  |
| 2.342999999999978 | 1.591 |  |  |
| 2.345999999999978 | 1.579 |  |  |
| 2.348999999999978 | 1.567 |  |  |
| 2.351999999999978 | 1.555 |  |  |
| 2.354999999999978 | 1.543 |  |  |
| 2.357999999999978 | 1.532 |  |  |
| 2.360999999999978 | 1.52 |  |  |
| 2.363999999999979 | 1.508 |  |  |
| 2.366999999999979 | 1.496 |  |  |
| 2.369999999999979 | 1.484 |  |  |
| 2.372999999999979 | 1.473 |  |  |
| 2.375999999999979 | 1.461 |  |  |
| 2.378999999999979 | 1.449 |  |  |
| 2.381999999999979 | 1.438 |  |  |
| 2.384999999999979 | 1.426 |  |  |
| 2.387999999999979 | 1.414 |  |  |
| 2.39099999999998 | 1.403 |  |  |
| 2.39399999999998 | 1.391 |  |  |
| 2.39699999999998 | 1.38 |  |  |
| 2.39999999999998 | 1.368 |  |  |
| 2.40299999999998 | 1.356 |  |  |
| 2.40599999999998 | 1.345 |  |  |
| 2.40899999999998 | 1.334 |  |  |
| 2.41199999999998 | 1.322 |  |  |
| 2.41499999999998 | 1.311 |  |  |
| 2.417999999999981 | 1.299 |  |  |
| 2.420999999999981 | 1.288 |  |  |
| 2.423999999999981 | 1.277 |  |  |
| 2.426999999999981 | 1.265 |  |  |
| 2.429999999999981 | 1.254 |  |  |
| 2.432999999999981 | 1.243 |  |  |
| 2.435999999999981 | 1.232 |  |  |
| 2.438999999999981 | 1.22 |  |  |
| 2.441999999999981 | 1.209 |  |  |
| 2.444999999999982 | 1.198 |  |  |
| 2.447999999999982 | 1.187 |  |  |
| 2.450999999999982 | 1.176 |  |  |
| 2.453999999999982 | 1.165 |  |  |
| 2.456999999999982 | 1.154 |  |  |
| 2.459999999999982 | 1.143 |  |  |
| 2.462999999999982 | 1.132 |  |  |
| 2.465999999999982 | 1.121 |  |  |
| 2.468999999999983 | 1.11 |  |  |
| 2.471999999999983 | 1.1 |  |  |
| 2.474999999999983 | 1.089 |  |  |
| 2.477999999999983 | 1.078 |  |  |
| 2.480999999999983 | 1.067 |  |  |
| 2.483999999999983 | 1.057 |  |  |
| 2.486999999999983 | 1.046 |  |  |
| 2.489999999999983 | 1.035 |  |  |
| 2.492999999999983 | 1.025 |  |  |
| 2.495999999999984 | 1.014 |  |  |
| 2.498999999999984 | 1.004 |  |  |
| 2.501999999999984 | 0.993 |  |  |
| 2.504999999999984 | 0.983 |  |  |
| 2.507999999999984 | 0.972 |  |  |
| 2.510999999999984 | 0.962 |  |  |
| 2.513999999999984 | 0.951 |  |  |
| 2.516999999999984 | 0.941 |  |  |
| 2.519999999999984 | 0.931 |  |  |
| 2.522999999999985 | 0.921 |  |  |
| 2.525999999999985 | 0.91 |  |  |
| 2.528999999999985 | 0.9 |  |  |
| 2.531999999999985 | 0.89 |  |  |
| 2.534999999999985 | 0.88 |  |  |
| 2.537999999999985 | 0.87 |  |  |
| 2.540999999999985 | 0.86 |  |  |
| 2.543999999999985 | 0.85 |  |  |
| 2.546999999999985 | 0.84 |  |  |
| 2.549999999999986 | 0.83 |  |  |
| 2.552999999999986 | 0.82 |  |  |
| 2.555999999999986 | 0.811 |  |  |
| 2.558999999999986 | 0.801 |  |  |
| 2.561999999999986 | 0.791 |  |  |
| 2.564999999999986 | 0.781 |  |  |
| 2.567999999999986 | 0.772 |  |  |
| 2.570999999999986 | 0.762 |  |  |
| 2.573999999999987 | 0.753 |  |  |
| 2.576999999999987 | 0.743 |  |  |
| 2.579999999999987 | 0.734 |  |  |
| 2.582999999999987 | 0.724 |  |  |
| 2.585999999999987 | 0.715 |  |  |
| 2.588999999999987 | 0.706 |  |  |
| 2.591999999999987 | 0.696 |  |  |
| 2.594999999999987 | 0.687 |  |  |
| 2.597999999999987 | 0.678 |  |  |
| 2.600999999999987 | 0.669 |  |  |
| 2.603999999999988 | 0.66 |  |  |
| 2.606999999999988 | 0.651 |  |  |
| 2.609999999999988 | 0.642 |  |  |
| 2.612999999999988 | 0.633 |  |  |
| 2.615999999999988 | 0.624 |  |  |
| 2.618999999999988 | 0.615 |  |  |
| 2.621999999999988 | 0.606 |  |  |
| 2.624999999999988 | 0.598 |  |  |
| 2.627999999999988 | 0.589 |  |  |
| 2.630999999999989 | 0.58 |  |  |
| 2.633999999999989 | 0.572 |  |  |
| 2.636999999999989 | 0.563 |  |  |
| 2.639999999999989 | 0.555 |  |  |
| 2.642999999999989 | 0.546 |  |  |
| 2.645999999999989 | 0.538 |  |  |
| 2.648999999999989 | 0.53 |  |  |
| 2.651999999999989 | 0.521 |  |  |
| 2.654999999999989 | 0.513 |  |  |
| 2.65799999999999 | 0.505 |  |  |
| 2.66099999999999 | 0.497 |  |  |
| 2.66399999999999 | 0.489 |  |  |
| 2.66699999999999 | 0.481 |  |  |
| 2.66999999999999 | 0.473 |  |  |
| 2.67299999999999 | 0.465 |  |  |
| 2.67599999999999 | 0.457 |  |  |
| 2.67899999999999 | 0.449 |  |  |
| 2.681999999999991 | 0.441 |  |  |
| 2.684999999999991 | 0.434 |  |  |
| 2.687999999999991 | 0.426 |  |  |
| 2.690999999999991 | 0.418 |  |  |
| 2.693999999999991 | 0.411 |  |  |
| 2.696999999999991 | 0.403 |  |  |
| 2.699999999999991 | 0.396 |  |  |
| 2.702999999999991 | 0.389 |  |  |
| 2.705999999999991 | 0.381 |  |  |
| 2.708999999999992 | 0.374 |  |  |
| 2.711999999999992 | 0.367 |  |  |
| 2.714999999999992 | 0.36 |  |  |
| 2.717999999999992 | 0.353 |  |  |
| 2.720999999999992 | 0.346 |  |  |
| 2.723999999999992 | 0.339 |  |  |
| 2.726999999999992 | 0.332 |  |  |
| 2.729999999999992 | 0.325 |  |  |
| 2.732999999999992 | 0.318 |  |  |
| 2.735999999999993 | 0.312 |  |  |
| 2.738999999999993 | 0.305 |  |  |
| 2.741999999999993 | 0.298 |  |  |
| 2.744999999999993 | 0.292 |  |  |
| 2.747999999999993 | 0.286 |  |  |
| 2.750999999999993 | 0.279 |  |  |
| 2.753999999999993 | 0.273 |  |  |
| 2.756999999999993 | 0.267 |  |  |
| 2.759999999999993 | 0.26 |  |  |
| 2.762999999999994 | 0.254 |  |  |
| 2.765999999999994 | 0.248 |  |  |
| 2.768999999999994 | 0.242 |  |  |
| 2.771999999999994 | 0.236 |  |  |
| 2.774999999999994 | 0.23 |  |  |
| 2.777999999999994 | 0.225 |  |  |
| 2.780999999999994 | 0.219 |  |  |
| 2.783999999999994 | 0.213 |  |  |
| 2.786999999999995 | 0.208 |  |  |
| 2.789999999999995 | 0.202 |  |  |
| 2.792999999999995 | 0.197 |  |  |
| 2.795999999999995 | 0.191 |  |  |
| 2.798999999999995 | 0.186 |  |  |
| 2.801999999999995 | 0.18 |  |  |
| 2.804999999999995 | 0.175 |  |  |
| 2.807999999999995 | 0.17 |  |  |
| 2.810999999999995 | 0.165 |  |  |
| 2.813999999999996 | 0.16 |  |  |
| 2.816999999999996 | 0.155 |  |  |
| 2.819999999999996 | 0.15 |  |  |
| 2.822999999999996 | 0.146 |  |  |
| 2.825999999999996 | 0.141 |  |  |
| 2.828999999999996 | 0.136 |  |  |
| 2.831999999999996 | 0.132 |  |  |
| 2.834999999999996 | 0.127 |  |  |
| 2.837999999999996 | 0.123 |  |  |
| 2.840999999999997 | 0.118 |  |  |
| 2.843999999999997 | 0.114 |  |  |
| 2.846999999999997 | 0.11 |  |  |
| 2.849999999999997 | 0.106 |  |  |
| 2.852999999999997 | 0.102 |  |  |
| 2.855999999999997 | 0.098 |  |  |
| 2.858999999999997 | 0.094 |  |  |
| 2.861999999999997 | 0.09 |  |  |
| 2.864999999999997 | 0.086 |  |  |
| 2.867999999999998 | 0.083 |  |  |
| 2.870999999999998 | 0.079 |  |  |
| 2.873999999999998 | 0.075 |  |  |
| 2.876999999999998 | 0.072 |  |  |
| 2.879999999999998 | 0.069 |  |  |
| 2.882999999999998 | 0.065 |  |  |
| 2.885999999999998 | 0.062 |  |  |
| 2.888999999999998 | 0.059 |  |  |
| 2.891999999999999 | 0.056 |  |  |
| 2.894999999999999 | 0.053 |  |  |
| 2.897999999999999 | 0.05 |  |  |
| 2.900999999999999 | 0.047 |  |  |
| 2.904 | 0.044 |  |  |
| 2.906999999999999 | 0.042 |  |  |
| 2.909999999999999 | 0.039 |  |  |
| 2.912999999999999 | 0.037 |  |  |
| 2.915999999999999 | 0.034 |  |  |
| 2.919 | 0.032 |  |  |
| 2.922 | 0.029 |  |  |
| 2.925 | 0.027 |  |  |
| 2.928 | 0.025 |  |  |
| 2.931 | 0.023 |  |  |
| 2.934 | 0.021 |  |  |
| 2.937 | 0.019 |  |  |
| 2.94 | 0.018 |  |  |
| 2.943 | 0.016 |  |  |
| 2.946000000000001 | 0.014 |  |  |
| 2.949000000000001 | 0.013 |  |  |
| 2.952000000000001 | 0.011 |  |  |
| 2.955000000000001 | 0.01 |  |  |
| 2.958000000000001 | 0.009 |  |  |
| 2.961000000000001 | 0.007 |  |  |
| 2.964000000000001 | 0.006 |  |  |
| 2.967000000000001 | 0.005 |  |  |
| 2.970000000000001 | 0.004 |  |  |
| 2.973000000000002 | 0.004 |  |  |
| 2.976000000000002 | 0.003 |  |  |
| 2.979000000000002 | 0.002 |  |  |
| 2.982000000000002 | 0.002 |  |  |
| 2.985000000000002 | 0.001 |  |  |
| 2.988000000000002 | 0.001 |  |  |
| 2.991000000000002 | 0 |  |  |
| 2.994000000000002 | 0 |  |  |
| 2.997000000000003 | 0 |  |  |
| 3.000000000000003 | 0 |  |  |
| 3.003000000000003 | 0 |  |  |
| 3.006000000000003 | 0 |  |  |
| 3.009000000000003 | 0 |  |  |
| 3.012000000000003 | 0.001 |  |  |
| 3.015000000000003 | 0.001 |  |  |
| 3.018000000000003 | 0.002 |  |  |
| 3.021000000000003 | 0.002 |  |  |
| 3.024000000000004 | 0.003 |  |  |
| 3.027000000000004 | 0.004 |  |  |
| 3.030000000000004 | 0.005 |  |  |
| 3.033000000000004 | 0.006 |  |  |
| 3.036000000000004 | 0.007 |  |  |
| 3.039000000000004 | 0.008 |  |  |
| 3.042000000000004 | 0.009 |  |  |
| 3.045000000000004 | 0.01 |  |  |
| 3.048000000000004 | 0.012 |  |  |
| 3.051000000000005 | 0.013 |  |  |
| 3.054000000000005 | 0.015 |  |  |
| 3.057000000000005 | 0.017 |  |  |
| 3.060000000000005 | 0.018 |  |  |
| 3.063000000000005 | 0.02 |  |  |
| 3.066000000000005 | 0.022 |  |  |
| 3.069000000000005 | 0.024 |  |  |
| 3.072000000000005 | 0.027 |  |  |
| 3.075000000000005 | 0.029 |  |  |
| 3.078000000000006 | 0.031 |  |  |
| 3.081000000000006 | 0.034 |  |  |
| 3.084000000000006 | 0.036 |  |  |
| 3.087000000000006 | 0.039 |  |  |
| 3.090000000000006 | 0.042 |  |  |
| 3.093000000000006 | 0.045 |  |  |
| 3.096000000000006 | 0.048 |  |  |
| 3.099000000000006 | 0.051 |  |  |
| 3.102000000000007 | 0.054 |  |  |
| 3.105000000000007 | 0.057 |  |  |
| 3.108000000000007 | 0.061 |  |  |
| 3.111000000000007 | 0.064 |  |  |
| 3.114000000000007 | 0.068 |  |  |
| 3.117000000000007 | 0.072 |  |  |
| 3.120000000000007 | 0.075 |  |  |
| 3.123000000000007 | 0.079 |  |  |
| 3.126000000000007 | 0.083 |  |  |
| 3.129000000000008 | 0.087 |  |  |
| 3.132000000000008 | 0.092 |  |  |
| 3.135000000000008 | 0.096 |  |  |
| 3.138000000000008 | 0.1 |  |  |
| 3.141000000000008 | 0.105 |  |  |
| 3.144000000000008 | 0.11 |  |  |
| 3.147000000000008 | 0.114 |  |  |
| 3.150000000000008 | 0.119 |  |  |
| 3.153000000000008 | 0.124 |  |  |
| 3.156000000000009 | 0.129 |  |  |
| 3.159000000000009 | 0.134 |  |  |
| 3.162000000000009 | 0.14 |  |  |
| 3.165000000000009 | 0.145 |  |  |
| 3.16800000000001 | 0.151 |  |  |
| 3.171000000000009 | 0.156 |  |  |
| 3.174000000000009 | 0.162 |  |  |
| 3.177000000000009 | 0.168 |  |  |
| 3.180000000000009 | 0.174 |  |  |
| 3.18300000000001 | 0.18 |  |  |
| 3.18600000000001 | 0.186 |  |  |
| 3.18900000000001 | 0.192 |  |  |
| 3.19200000000001 | 0.198 |  |  |
| 3.19500000000001 | 0.205 |  |  |
| 3.19800000000001 | 0.212 |  |  |
| 3.20100000000001 | 0.218 |  |  |
| 3.20400000000001 | 0.225 |  |  |
| 3.20700000000001 | 0.232 |  |  |
| 3.210000000000011 | 0.239 |  |  |
| 3.213000000000011 | 0.246 |  |  |
| 3.216000000000011 | 0.253 |  |  |
| 3.219000000000011 | 0.261 |  |  |
| 3.222000000000011 | 0.268 |  |  |
| 3.225000000000011 | 0.276 |  |  |
| 3.228000000000011 | 0.284 |  |  |
| 3.231000000000011 | 0.291 |  |  |
| 3.234000000000012 | 0.299 |  |  |
| 3.237000000000012 | 0.307 |  |  |
| 3.240000000000012 | 0.316 |  |  |
| 3.243000000000012 | 0.324 |  |  |
| 3.246000000000012 | 0.332 |  |  |
| 3.249000000000012 | 0.341 |  |  |
| 3.252000000000012 | 0.35 |  |  |
| 3.255000000000012 | 0.358 |  |  |
| 3.258000000000012 | 0.367 |  |  |
| 3.261000000000012 | 0.376 |  |  |
| 3.264000000000012 | 0.385 |  |  |
| 3.267000000000012 | 0.395 |  |  |
| 3.270000000000013 | 0.404 |  |  |
| 3.273000000000013 | 0.413 |  |  |
| 3.276000000000013 | 0.423 |  |  |
| 3.279000000000013 | 0.433 |  |  |
| 3.282000000000013 | 0.442 |  |  |
| 3.285000000000013 | 0.452 |  |  |
| 3.288000000000013 | 0.462 |  |  |
| 3.291000000000014 | 0.473 |  |  |
| 3.294000000000014 | 0.483 |  |  |
| 3.297000000000014 | 0.493 |  |  |
| 3.300000000000014 | 0.504 |  |  |
| 3.303000000000014 | 0.515 |  |  |
| 3.306000000000014 | 0.525 |  |  |
| 3.309000000000014 | 0.536 |  |  |
| 3.312000000000014 | 0.547 |  |  |
| 3.315000000000015 | 0.559 |  |  |
| 3.318000000000015 | 0.57 |  |  |
| 3.321000000000015 | 0.581 |  |  |
| 3.324000000000015 | 0.593 |  |  |
| 3.327000000000015 | 0.605 |  |  |
| 3.330000000000015 | 0.616 |  |  |
| 3.333000000000015 | 0.628 |  |  |
| 3.336000000000015 | 0.64 |  |  |
| 3.339000000000015 | 0.653 |  |  |
| 3.342000000000016 | 0.665 |  |  |
| 3.345000000000016 | 0.677 |  |  |
| 3.348000000000016 | 0.69 |  |  |
| 3.351000000000016 | 0.702 |  |  |
| 3.354000000000016 | 0.715 |  |  |
| 3.357000000000016 | 0.728 |  |  |
| 3.360000000000016 | 0.741 |  |  |
| 3.363000000000016 | 0.755 |  |  |
| 3.366000000000016 | 0.768 |  |  |
| 3.369000000000017 | 0.781 |  |  |
| 3.372000000000017 | 0.795 |  |  |
| 3.375000000000017 | 0.809 |  |  |
| 3.378000000000017 | 0.822 |  |  |
| 3.381000000000017 | 0.836 |  |  |
| 3.384000000000017 | 0.851 |  |  |
| 3.387000000000017 | 0.865 |  |  |
| 3.390000000000017 | 0.879 |  |  |
| 3.393000000000017 | 0.894 |  |  |
| 3.396000000000018 | 0.908 |  |  |
| 3.399000000000018 | 0.923 |  |  |
| 3.402000000000018 | 0.938 |  |  |
| 3.405000000000018 | 0.953 |  |  |
| 3.408000000000018 | 0.968 |  |  |
| 3.411000000000018 | 0.983 |  |  |
| 3.414000000000018 | 0.999 |  |  |
| 3.417000000000018 | 1.014 |  |  |
| 3.420000000000019 | 1.03 |  |  |
| 3.423000000000019 | 1.046 |  |  |
| 3.426000000000019 | 1.062 |  |  |
| 3.429000000000019 | 1.078 |  |  |
| 3.432000000000019 | 1.094 |  |  |
| 3.435000000000019 | 1.111 |  |  |
| 3.438000000000019 | 1.127 |  |  |
| 3.441000000000019 | 1.144 |  |  |
| 3.444000000000019 | 1.161 |  |  |
| 3.44700000000002 | 1.178 |  |  |
| 3.45000000000002 | 1.195 |  |  |
| 3.45300000000002 | 1.212 |  |  |
| 3.45600000000002 | 1.229 |  |  |
| 3.45900000000002 | 1.247 |  |  |
| 3.46200000000002 | 1.264 |  |  |
| 3.46500000000002 | 1.282 |  |  |
| 3.46800000000002 | 1.3 |  |  |
| 3.47100000000002 | 1.318 |  |  |
| 3.474000000000021 | 1.336 |  |  |
| 3.477000000000021 | 1.355 |  |  |
| 3.480000000000021 | 1.373 |  |  |
| 3.483000000000021 | 1.392 |  |  |
| 3.486000000000021 | 1.411 |  |  |
| 3.489000000000021 | 1.429 |  |  |
| 3.492000000000021 | 1.449 |  |  |
| 3.495000000000021 | 1.468 |  |  |
| 3.498000000000021 | 1.487 |  |  |
| 3.501000000000022 | 1.507 |  |  |
| 3.504000000000022 | 1.526 |  |  |
| 3.507000000000022 | 1.546 |  |  |
| 3.510000000000022 | 1.566 |  |  |
| 3.513000000000022 | 1.586 |  |  |
| 3.516000000000022 | 1.606 |  |  |
| 3.519000000000022 | 1.626 |  |  |
| 3.522000000000022 | 1.647 |  |  |
| 3.525000000000023 | 1.668 |  |  |
| 3.528000000000023 | 1.688 |  |  |
| 3.531000000000023 | 1.709 |  |  |
| 3.534000000000023 | 1.73 |  |  |
| 3.537000000000023 | 1.752 |  |  |
| 3.540000000000023 | 1.773 |  |  |
| 3.543000000000023 | 1.794 |  |  |
| 3.546000000000023 | 1.816 |  |  |
| 3.549000000000023 | 1.838 |  |  |
| 3.552000000000024 | 1.86 |  |  |
| 3.555000000000024 | 1.882 |  |  |
| 3.558000000000024 | 1.904 |  |  |
| 3.561000000000024 | 1.927 |  |  |
| 3.564000000000024 | 1.949 |  |  |
| 3.567000000000024 | 1.972 |  |  |
| 3.570000000000024 | 1.995 |  |  |
| 3.573000000000024 | 2.018 |  |  |
| 3.576000000000024 | 2.041 |  |  |
| 3.579000000000025 | 2.064 |  |  |
| 3.582000000000025 | 2.088 |  |  |
| 3.585000000000025 | 2.112 |  |  |
| 3.588000000000025 | 2.135 |  |  |
| 3.591000000000025 | 2.159 |  |  |
| 3.594000000000025 | 2.183 |  |  |
| 3.597000000000025 | 2.208 |  |  |
| 3.600000000000025 | 2.232 |  |  |
| 3.603000000000025 | 2.257 |  |  |
| 3.606000000000026 | 2.281 |  |  |
| 3.609000000000026 | 2.306 |  |  |
| 3.612000000000026 | 2.331 |  |  |
| 3.615000000000026 | 2.356 |  |  |
| 3.618000000000026 | 2.382 |  |  |
| 3.621000000000026 | 2.407 |  |  |
| 3.624000000000026 | 2.433 |  |  |
| 3.627000000000026 | 2.459 |  |  |
| 3.630000000000026 | 2.485 |  |  |
| 3.633000000000027 | 2.511 |  |  |
| 3.636000000000027 | 2.537 |  |  |
| 3.639000000000027 | 2.563 |  |  |
| 3.642000000000027 | 2.59 |  |  |
| 3.645000000000027 | 2.617 |  |  |
| 3.648000000000027 | 2.644 |  |  |
| 3.651000000000027 | 2.671 |  |  |
| 3.654000000000027 | 2.698 |  |  |
| 3.657000000000027 | 2.725 |  |  |
| 3.660000000000028 | 2.753 |  |  |
| 3.663000000000028 | 2.781 |  |  |
| 3.666000000000028 | 2.809 |  |  |
| 3.669000000000028 | 2.837 |  |  |
| 3.672000000000028 | 2.865 |  |  |
| 3.675000000000028 | 2.893 |  |  |
| 3.678000000000028 | 2.922 |  |  |
| 3.681000000000028 | 2.95 |  |  |
| 3.684000000000028 | 2.979 |  |  |
| 3.687000000000029 | 3.008 |  |  |
| 3.690000000000029 | 3.038 |  |  |
| 3.693000000000029 | 3.067 |  |  |
| 3.696000000000029 | 3.096 |  |  |
| 3.699000000000029 | 3.126 |  |  |
| 3.702000000000029 | 3.156 |  |  |
| 3.705000000000029 | 3.186 |  |  |
| 3.708000000000029 | 3.216 |  |  |
| 3.71100000000003 | 3.246 |  |  |
| 3.71400000000003 | 3.277 |  |  |
| 3.71700000000003 | 3.308 |  |  |
| 3.72000000000003 | 3.338 |  |  |
| 3.72300000000003 | 3.37 |  |  |
| 3.72600000000003 | 3.401 |  |  |
| 3.72900000000003 | 3.432 |  |  |
| 3.73200000000003 | 3.464 |  |  |
| 3.73500000000003 | 3.495 |  |  |
| 3.738000000000031 | 3.527 |  |  |
| 3.741000000000031 | 3.559 |  |  |
| 3.744000000000031 | 3.591 |  |  |
| 3.747000000000031 | 3.624 |  |  |
| 3.750000000000031 | 3.656 |  |  |
| 3.753000000000031 | 3.689 |  |  |
| 3.756000000000031 | 3.722 |  |  |
| 3.759000000000031 | 3.755 |  |  |
| 3.762000000000031 | 3.788 |  |  |
| 3.765000000000032 | 3.822 |  |  |
| 3.768000000000032 | 3.855 |  |  |
| 3.771000000000032 | 3.889 |  |  |
| 3.774000000000032 | 3.923 |  |  |
| 3.777000000000032 | 3.957 |  |  |
| 3.780000000000032 | 3.991 |  |  |
| 3.783000000000032 | 4.026 |  |  |
| 3.786000000000032 | 4.06 |  |  |
| 3.789000000000032 | 4.095 |  |  |
| 3.792000000000033 | 4.13 |  |  |
| 3.795000000000033 | 4.165 |  |  |
| 3.798000000000033 | 4.2 |  |  |
| 3.801000000000033 | 4.236 |  |  |
| 3.804000000000033 | 4.272 |  |  |
| 3.807000000000033 | 4.307 |  |  |
| 3.810000000000033 | 4.343 |  |  |
| 3.813000000000033 | 4.38 |  |  |
| 3.816000000000034 | 4.416 |  |  |
| 3.819000000000034 | 4.453 |  |  |
| 3.822000000000034 | 4.489 |  |  |
| 3.825000000000034 | 4.526 |  |  |
| 3.828000000000034 | 4.563 |  |  |
| 3.831000000000034 | 4.601 |  |  |
| 3.834000000000034 | 4.638 |  |  |
| 3.837000000000034 | 4.676 |  |  |
| 3.840000000000034 | 4.713 |  |  |
| 3.843000000000035 | 4.751 |  |  |
| 3.846000000000035 | 4.79 |  |  |
| 3.849000000000035 | 4.828 |  |  |
| 3.852000000000035 | 4.866 |  |  |
| 3.855000000000035 | 4.905 |  |  |
| 3.858000000000035 | 4.944 |  |  |
| 3.861000000000035 | 4.983 |  |  |
| 3.864000000000035 | 5.022 |  |  |
| 3.867000000000035 | 5.062 |  |  |
| 3.870000000000036 | 5.102 |  |  |
| 3.873000000000036 | 5.141 |  |  |
| 3.876000000000036 | 5.181 |  |  |
| 3.879000000000036 | 5.222 |  |  |
| 3.882000000000036 | 5.262 |  |  |
| 3.885000000000036 | 5.302 |  |  |
| 3.888000000000036 | 5.343 |  |  |
| 3.891000000000036 | 5.384 |  |  |
| 3.894000000000036 | 5.425 |  |  |
| 3.897000000000037 | 5.467 |  |  |
| 3.900000000000037 | 5.508 |  |  |
| 3.903000000000037 | 5.55 |  |  |
| 3.906000000000037 | 5.592 |  |  |
| 3.909000000000037 | 5.634 |  |  |
| 3.912000000000037 | 5.676 |  |  |
| 3.915000000000037 | 5.718 |  |  |
| 3.918000000000037 | 5.761 |  |  |
| 3.921000000000038 | 5.804 |  |  |
| 3.924000000000038 | 5.847 |  |  |
| 3.927000000000038 | 5.89 |  |  |
| 3.930000000000038 | 5.933 |  |  |
| 3.933000000000038 | 5.977 |  |  |
| 3.936000000000038 | 6.021 |  |  |
| 3.939000000000038 | 6.064 |  |  |
| 3.942000000000038 | 6.109 |  |  |
| 3.945000000000038 | 6.153 |  |  |
| 3.948000000000039 | 6.197 |  |  |
| 3.951000000000039 | 6.242 |  |  |
| 3.954000000000039 | 6.287 |  |  |
| 3.957000000000039 | 6.332 |  |  |
| 3.96000000000004 | 6.377 |  |  |
| 3.96300000000004 | 6.423 |  |  |
| 3.966000000000039 | 6.469 |  |  |
| 3.969000000000039 | 6.515 |  |  |
| 3.972000000000039 | 6.561 |  |  |
| 3.97500000000004 | 6.607 |  |  |
| 3.97800000000004 | 6.653 |  |  |
| 3.98100000000004 | 6.7 |  |  |
| 3.98400000000004 | 6.747 |  |  |
| 3.98700000000004 | 6.794 |  |  |
| 3.99000000000004 | 6.841 |  |  |
| 3.99300000000004 | 6.889 |  |  |
| 3.99600000000004 | 6.936 |  |  |
| 3.99900000000004 | 6.984 |  |  |
| 4.002000000000041 | 7.032 |  |  |
| 4.005000000000041 | 7.08 |  |  |
| 4.008000000000041 | 7.129 |  |  |
| 4.011000000000041 | 7.177 |  |  |
| 4.014000000000041 | 7.226 |  |  |
| 4.017000000000041 | 7.275 |  |  |
| 4.020000000000041 | 7.324 |  |  |
| 4.023000000000041 | 7.374 |  |  |
| 4.026000000000042 | 7.423 |  |  |
| 4.029000000000042 | 7.473 |  |  |
| 4.032000000000042 | 7.523 |  |  |
| 4.035000000000042 | 7.574 |  |  |
| 4.038000000000042 | 7.624 |  |  |
| 4.041000000000042 | 7.675 |  |  |
| 4.044000000000042 | 7.725 |  |  |
| 4.047000000000042 | 7.777 |  |  |
| 4.050000000000042 | 7.828 |  |  |
| 4.053000000000043 | 7.879 |  |  |
| 4.056000000000043 | 7.931 |  |  |
| 4.059000000000043 | 7.983 |  |  |
| 4.062000000000043 | 8.035 |  |  |
| 4.065000000000043 | 8.087 |  |  |
| 4.068000000000043 | 8.139 |  |  |
| 4.071000000000043 | 8.192 |  |  |
| 4.074000000000043 | 8.245 |  |  |
| 4.077000000000043 | 8.298 |  |  |
| 4.080000000000044 | 8.351 |  |  |
| 4.083000000000044 | 8.405 |  |  |
| 4.086000000000044 | 8.459 |  |  |
| 4.089000000000044 | 8.513 |  |  |
| 4.092000000000044 | 8.567 |  |  |
| 4.095000000000044 | 8.621 |  |  |
| 4.098000000000044 | 8.676 |  |  |
| 4.101000000000044 | 8.73 |  |  |
| 4.104000000000044 | 8.785 |  |  |
| 4.107000000000045 | 8.84 |  |  |
| 4.110000000000045 | 8.896 |  |  |
| 4.113000000000045 | 8.951 |  |  |
| 4.116000000000045 | 9.007 |  |  |
| 4.119000000000045 | 9.063 |  |  |
| 4.122000000000045 | 9.119 |  |  |
| 4.125000000000045 | 9.176 |  |  |
| 4.128000000000045 | 9.232 |  |  |
| 4.131000000000045 | 9.289 |  |  |
| 4.134000000000046 | 9.346 |  |  |
| 4.137000000000046 | 9.404 |  |  |
| 4.140000000000046 | 9.461 |  |  |
| 4.143000000000046 | 9.519 |  |  |
| 4.146000000000046 | 9.577 |  |  |
| 4.149000000000046 | 9.635 |  |  |
| 4.152000000000046 | 9.693 |  |  |
| 4.155000000000046 | 9.752 |  |  |
| 4.158000000000047 | 9.81 |  |  |
| 4.161000000000047 | 9.869 |  |  |
| 4.164000000000047 | 9.929 |  |  |
| 4.167000000000047 | 9.988 |  |  |
| 4.170000000000047 | 10.048 |  |  |
| 4.173000000000047 | 10.108 |  |  |
| 4.176000000000047 | 10.168 |  |  |
| 4.179000000000047 | 10.228 |  |  |
| 4.182000000000047 | 10.288 |  |  |
| 4.185000000000048 | 10.349 |  |  |
| 4.188000000000048 | 10.41 |  |  |
| 4.191000000000048 | 10.471 |  |  |
| 4.194000000000048 | 10.533 |  |  |
| 4.197000000000048 | 10.594 |  |  |
| 4.200000000000048 | 10.656 |  |  |
| 4.203000000000048 | 10.718 |  |  |
| 4.206000000000048 | 10.78 |  |  |
| 4.209000000000048 | 10.843 |  |  |
| 4.212000000000049 | 10.905 |  |  |
| 4.215000000000049 | 10.968 |  |  |
| 4.218000000000049 | 11.031 |  |  |
| 4.221000000000049 | 11.095 |  |  |
| 4.224000000000049 | 11.158 |  |  |
| 4.227000000000049 | 11.222 |  |  |
| 4.23000000000005 | 11.286 |  |  |
| 4.23300000000005 | 11.35 |  |  |
| 4.23600000000005 | 11.415 |  |  |
| 4.23900000000005 | 11.48 |  |  |
| 4.24200000000005 | 11.545 |  |  |
| 4.24500000000005 | 11.61 |  |  |
| 4.24800000000005 | 11.675 |  |  |
| 4.25100000000005 | 11.741 |  |  |
| 4.25400000000005 | 11.806 |  |  |
| 4.25700000000005 | 11.872 |  |  |
| 4.26000000000005 | 11.939 |  |  |
| 4.263000000000051 | 12.005 |  |  |
| 4.266000000000051 | 12.072 |  |  |
| 4.269000000000051 | 12.139 |  |  |
| 4.272000000000051 | 12.206 |  |  |
| 4.275000000000051 | 12.273 |  |  |
| 4.278000000000051 | 12.341 |  |  |
| 4.281000000000051 | 12.409 |  |  |
| 4.284000000000051 | 12.477 |  |  |
| 4.287000000000051 | 12.545 |  |  |
| 4.290000000000052 | 12.614 |  |  |
| 4.293000000000052 | 12.683 |  |  |
| 4.296000000000052 | 12.752 |  |  |
| 4.299000000000052 | 12.821 |  |  |
| 4.302000000000052 | 12.89 |  |  |
| 4.305000000000052 | 12.96 |  |  |
| 4.308000000000052 | 13.03 |  |  |
| 4.311000000000052 | 13.1 |  |  |
| 4.314000000000052 | 13.17 |  |  |
| 4.317000000000053 | 13.241 |  |  |
| 4.320000000000053 | 13.312 |  |  |
| 4.323000000000053 | 13.383 |  |  |
| 4.326000000000053 | 13.454 |  |  |
| 4.329000000000053 | 13.526 |  |  |
| 4.332000000000053 | 13.598 |  |  |
| 4.335000000000053 | 13.67 |  |  |
| 4.338000000000053 | 13.742 |  |  |
| 4.341000000000053 | 13.814 |  |  |
| 4.344000000000054 | 13.887 |  |  |
| 4.347000000000054 | 13.96 |  |  |
| 4.350000000000054 | 14.033 |  |  |
| 4.353000000000054 | 14.107 |  |  |
| 4.356000000000054 | 14.18 |  |  |
| 4.359000000000054 | 14.254 |  |  |
| 4.362000000000054 | 14.328 |  |  |
| 4.365000000000054 | 14.403 |  |  |
| 4.368000000000054 | 14.477 |  |  |
| 4.371000000000054 | 14.552 |  |  |
| 4.374000000000055 | 14.627 |  |  |
| 4.377000000000055 | 14.703 |  |  |
| 4.380000000000055 | 14.778 |  |  |
| 4.383000000000055 | 14.854 |  |  |
| 4.386000000000055 | 14.93 |  |  |
| 4.389000000000055 | 15.006 |  |  |
| 4.392000000000055 | 15.083 |  |  |
| 4.395000000000055 | 15.16 |  |  |
| 4.398000000000056 | 15.237 |  |  |
| 4.401000000000055 | 15.314 |  |  |
| 4.404000000000056 | 15.391 |  |  |
| 4.407000000000056 | 15.469 |  |  |
| 4.410000000000056 | 15.547 |  |  |
| 4.413000000000056 | 15.625 |  |  |
| 4.416000000000056 | 15.704 |  |  |
| 4.419000000000056 | 15.782 |  |  |
| 4.422000000000057 | 15.861 |  |  |
| 4.425000000000057 | 15.94 |  |  |
| 4.428000000000057 | 16.02 |  |  |
| 4.431000000000056 | 16.099 |  |  |
| 4.434000000000057 | 16.179 |  |  |
| 4.437000000000057 | 16.26 |  |  |
| 4.440000000000057 | 16.34 |  |  |
| 4.443000000000057 | 16.421 |  |  |
| 4.446000000000057 | 16.502 |  |  |
| 4.449000000000057 | 16.583 |  |  |
| 4.452000000000058 | 16.664 |  |  |
| 4.455000000000058 | 16.746 |  |  |
| 4.458000000000058 | 16.828 |  |  |
| 4.461000000000058 | 16.91 |  |  |
| 4.464000000000058 | 16.992 |  |  |
| 4.467000000000058 | 17.075 |  |  |
| 4.470000000000058 | 17.158 |  |  |
| 4.473000000000058 | 17.241 |  |  |
| 4.476000000000058 | 17.324 |  |  |
| 4.479000000000058 | 17.408 |  |  |
| 4.482000000000059 | 17.492 |  |  |
| 4.485000000000059 | 17.576 |  |  |
| 4.48800000000006 | 17.66 |  |  |
| 4.49100000000006 | 17.745 |  |  |
| 4.494000000000059 | 17.83 |  |  |
| 4.497000000000059 | 17.915 |  |  |
| 4.50000000000006 | 18 |  |  |
| 4.50300000000006 | 18.086 |  |  |
| 4.50600000000006 | 18.172 |  |  |
| 4.50900000000006 | 18.258 |  |  |
| 4.51200000000006 | 18.344 |  |  |
| 4.51500000000006 | 18.431 |  |  |
| 4.51800000000006 | 18.518 |  |  |
| 4.52100000000006 | 18.605 |  |  |
| 4.52400000000006 | 18.692 |  |  |
| 4.527000000000061 | 18.78 |  |  |
| 4.53000000000006 | 18.868 |  |  |
| 4.53300000000006 | 18.956 |  |  |
| 4.53600000000006 | 19.044 |  |  |
| 4.53900000000006 | 19.133 |  |  |
| 4.542000000000061 | 19.222 |  |  |
| 4.545000000000061 | 19.311 |  |  |
| 4.548000000000061 | 19.4 |  |  |
| 4.551000000000061 | 19.49 |  |  |
| 4.554000000000062 | 19.58 |  |  |
| 4.557000000000062 | 19.67 |  |  |
| 4.560000000000062 | 19.761 |  |  |
| 4.563000000000062 | 19.852 |  |  |
| 4.566000000000062 | 19.943 |  |  |
| 4.569000000000062 | 20.034 |  |  |
| 4.572000000000062 | 20.125 |  |  |
| 4.575000000000062 | 20.217 |  |  |
| 4.578000000000062 | 20.309 |  |  |
| 4.581000000000062 | 20.401 |  |  |
| 4.584000000000063 | 20.494 |  |  |
| 4.587000000000063 | 20.587 |  |  |
| 4.590000000000063 | 20.68 |  |  |
| 4.593000000000063 | 20.773 |  |  |
| 4.596000000000063 | 20.867 |  |  |
| 4.599000000000063 | 20.961 |  |  |
| 4.602000000000063 | 21.055 |  |  |
| 4.605000000000063 | 21.149 |  |  |
| 4.608000000000064 | 21.244 |  |  |
| 4.611000000000064 | 21.339 |  |  |
| 4.614000000000064 | 21.434 |  |  |
| 4.617000000000064 | 21.529 |  |  |
| 4.620000000000064 | 21.625 |  |  |
| 4.623000000000064 | 21.721 |  |  |
| 4.626000000000064 | 21.817 |  |  |
| 4.629000000000064 | 21.914 |  |  |
| 4.632000000000064 | 22.011 |  |  |
| 4.635000000000064 | 22.108 |  |  |
| 4.638000000000064 | 22.205 |  |  |
| 4.641000000000064 | 22.302 |  |  |
| 4.644000000000065 | 22.4 |  |  |
| 4.647000000000065 | 22.498 |  |  |
| 4.650000000000065 | 22.597 |  |  |
| 4.653000000000065 | 22.695 |  |  |
| 4.656000000000065 | 22.794 |  |  |
| 4.659000000000065 | 22.893 |  |  |
| 4.662000000000066 | 22.993 |  |  |
| 4.665000000000066 | 23.093 |  |  |
| 4.668000000000066 | 23.193 |  |  |
| 4.671000000000065 | 23.293 |  |  |
| 4.674000000000066 | 23.393 |  |  |
| 4.677000000000066 | 23.494 |  |  |
| 4.680000000000066 | 23.595 |  |  |
| 4.683000000000066 | 23.697 |  |  |
| 4.686000000000066 | 23.798 |  |  |
| 4.689000000000066 | 23.9 |  |  |
| 4.692000000000067 | 24.002 |  |  |
| 4.695000000000067 | 24.105 |  |  |
| 4.698000000000067 | 24.207 |  |  |
| 4.701000000000067 | 24.31 |  |  |
| 4.704000000000067 | 24.414 |  |  |
| 4.707000000000067 | 24.517 |  |  |
| 4.710000000000067 | 24.621 |  |  |
| 4.713000000000067 | 24.725 |  |  |
| 4.716000000000067 | 24.829 |  |  |
| 4.719000000000067 | 24.934 |  |  |
| 4.722000000000068 | 25.039 |  |  |
| 4.725000000000068 | 25.144 |  |  |
| 4.728000000000068 | 25.249 |  |  |
| 4.731000000000068 | 25.355 |  |  |
| 4.734000000000068 | 25.461 |  |  |
| 4.737000000000068 | 25.567 |  |  |
| 4.740000000000068 | 25.674 |  |  |
| 4.743000000000068 | 25.781 |  |  |
| 4.746000000000068 | 25.888 |  |  |
| 4.749000000000068 | 25.995 |  |  |
| 4.752000000000069 | 26.103 |  |  |
| 4.75500000000007 | 26.211 |  |  |
| 4.75800000000007 | 26.319 |  |  |
| 4.76100000000007 | 26.428 |  |  |
| 4.764000000000069 | 26.537 |  |  |
| 4.76700000000007 | 26.646 |  |  |
| 4.77000000000007 | 26.755 |  |  |
| 4.77300000000007 | 26.865 |  |  |
| 4.77600000000007 | 26.975 |  |  |
| 4.77900000000007 | 27.085 |  |  |
| 4.78200000000007 | 27.195 |  |  |
| 4.78500000000007 | 27.306 |  |  |
| 4.78800000000007 | 27.417 |  |  |
| 4.79100000000007 | 27.528 |  |  |
| 4.794000000000071 | 27.64 |  |  |
| 4.797000000000071 | 27.752 |  |  |
| 4.800000000000071 | 27.864 |  |  |
| 4.803000000000071 | 27.976 |  |  |
| 4.806000000000071 | 28.089 |  |  |
| 4.809000000000071 | 28.202 |  |  |
| 4.812000000000071 | 28.316 |  |  |
| 4.815000000000071 | 28.429 |  |  |
| 4.818000000000072 | 28.543 |  |  |
| 4.821000000000072 | 28.657 |  |  |
| 4.824000000000072 | 28.772 |  |  |
| 4.827000000000072 | 28.886 |  |  |
| 4.830000000000072 | 29.001 |  |  |
| 4.833000000000072 | 29.117 |  |  |
| 4.836000000000072 | 29.232 |  |  |
| 4.839000000000072 | 29.348 |  |  |
| 4.842000000000072 | 29.464 |  |  |
| 4.845000000000073 | 29.581 |  |  |
| 4.848000000000073 | 29.698 |  |  |
| 4.851000000000073 | 29.815 |  |  |
| 4.854000000000073 | 29.932 |  |  |
| 4.857000000000073 | 30.05 |  |  |
| 4.860000000000073 | 30.168 |  |  |
| 4.863000000000073 | 30.286 |  |  |
| 4.866000000000073 | 30.404 |  |  |
| 4.869000000000073 | 30.523 |  |  |
| 4.872000000000074 | 30.642 |  |  |
| 4.875000000000074 | 30.762 |  |  |
| 4.878000000000074 | 30.881 |  |  |
| 4.881000000000074 | 31.001 |  |  |
| 4.884000000000074 | 31.122 |  |  |
| 4.887000000000074 | 31.242 |  |  |
| 4.890000000000074 | 31.363 |  |  |
| 4.893000000000074 | 31.484 |  |  |
| 4.896000000000074 | 31.606 |  |  |
| 4.899000000000074 | 31.727 |  |  |
| 4.902000000000074 | 31.849 |  |  |
| 4.905000000000074 | 31.972 |  |  |
| 4.908000000000074 | 32.094 |  |  |
| 4.911000000000075 | 32.217 |  |  |
| 4.914000000000075 | 32.34 |  |  |
| 4.917000000000075 | 32.464 |  |  |
| 4.920000000000075 | 32.588 |  |  |
| 4.923000000000075 | 32.712 |  |  |
| 4.926000000000075 | 32.836 |  |  |
| 4.929000000000075 | 32.961 |  |  |
| 4.932000000000075 | 33.086 |  |  |
| 4.935000000000075 | 33.211 |  |  |
| 4.938000000000076 | 33.337 |  |  |
| 4.941000000000076 | 33.463 |  |  |
| 4.944000000000076 | 33.589 |  |  |
| 4.947000000000076 | 33.715 |  |  |
| 4.950000000000076 | 33.842 |  |  |
| 4.953000000000076 | 33.969 |  |  |
| 4.956000000000076 | 34.097 |  |  |
| 4.959000000000076 | 34.224 |  |  |
| 4.962000000000077 | 34.352 |  |  |
| 4.965000000000077 | 34.481 |  |  |
| 4.968000000000077 | 34.609 |  |  |
| 4.971000000000077 | 34.738 |  |  |
| 4.974000000000077 | 34.867 |  |  |
| 4.977000000000077 | 34.997 |  |  |
| 4.980000000000077 | 35.127 |  |  |
| 4.983000000000077 | 35.257 |  |  |
| 4.986000000000077 | 35.387 |  |  |
| 4.989000000000077 | 35.518 |  |  |
| 4.992000000000078 | 35.649 |  |  |
| 4.995000000000078 | 35.78 |  |  |
| 4.998000000000078 | 35.912 |  |  |
| 5.001000000000078 | 36.044 |  |  |
| 5.004000000000079 | 36.176 |  |  |
| 5.007000000000079 | 36.309 |  |  |
| 5.010000000000079 | 36.442 |  |  |
| 5.013000000000079 | 36.575 |  |  |
| 5.01600000000008 | 36.708 |  |  |
| 5.01900000000008 | 36.842 |  |  |
| 5.022000000000079 | 36.976 |  |  |
| 5.025000000000079 | 37.111 |  |  |
| 5.02800000000008 | 37.245 |  |  |
| 5.03100000000008 | 37.38 |  |  |
| 5.03400000000008 | 37.516 |  |  |
| 5.03700000000008 | 37.651 |  |  |
| 5.04000000000008 | 37.787 |  |  |
| 5.04300000000008 | 37.924 |  |  |
| 5.04600000000008 | 38.06 |  |  |
| 5.04900000000008 | 38.197 |  |  |
| 5.05200000000008 | 38.334 |  |  |
| 5.055000000000081 | 38.472 |  |  |
| 5.058000000000081 | 38.61 |  |  |
| 5.061000000000081 | 38.748 |  |  |
| 5.064000000000081 | 38.886 |  |  |
| 5.067000000000081 | 39.025 |  |  |
| 5.070000000000081 | 39.164 |  |  |
| 5.073000000000081 | 39.303 |  |  |
| 5.076000000000081 | 39.443 |  |  |
| 5.079000000000081 | 39.583 |  |  |
| 5.082000000000082 | 39.723 |  |  |
| 5.085000000000082 | 39.864 |  |  |
| 5.088000000000082 | 40.005 |  |  |
| 5.091000000000082 | 40.146 |  |  |
| 5.094000000000082 | 40.288 |  |  |
| 5.097000000000082 | 40.43 |  |  |
| 5.100000000000082 | 40.572 |  |  |
| 5.103000000000082 | 40.715 |  |  |
| 5.106000000000082 | 40.857 |  |  |
| 5.109000000000083 | 41.001 |  |  |
| 5.112000000000083 | 41.144 |  |  |
| 5.115000000000083 | 41.288 |  |  |
| 5.118000000000083 | 41.432 |  |  |
| 5.121000000000083 | 41.576 |  |  |
| 5.124000000000083 | 41.721 |  |  |
| 5.127000000000083 | 41.866 |  |  |
| 5.130000000000083 | 42.012 |  |  |
| 5.133000000000083 | 42.157 |  |  |
| 5.136000000000084 | 42.303 |  |  |
| 5.139000000000084 | 42.45 |  |  |
| 5.142000000000084 | 42.597 |  |  |
| 5.145000000000084 | 42.744 |  |  |
| 5.148000000000084 | 42.891 |  |  |
| 5.151000000000084 | 43.039 |  |  |
| 5.154000000000084 | 43.186 |  |  |
| 5.157000000000084 | 43.335 |  |  |
| 5.160000000000085 | 43.483 |  |  |
| 5.163000000000085 | 43.632 |  |  |
| 5.166000000000085 | 43.782 |  |  |
| 5.169000000000085 | 43.931 |  |  |
| 5.172000000000085 | 44.081 |  |  |
| 5.175000000000085 | 44.231 |  |  |
| 5.178000000000085 | 44.382 |  |  |
| 5.181000000000085 | 44.533 |  |  |
| 5.184000000000085 | 44.684 |  |  |
| 5.187000000000086 | 44.836 |  |  |
| 5.190000000000086 | 44.987 |  |  |
| 5.193000000000086 | 45.14 |  |  |
| 5.196000000000086 | 45.292 |  |  |
| 5.199000000000086 | 45.445 |  |  |
| 5.202000000000086 | 45.598 |  |  |
| 5.205000000000086 | 45.752 |  |  |
| 5.208000000000086 | 45.905 |  |  |
| 5.211000000000086 | 46.06 |  |  |
| 5.214000000000087 | 46.214 |  |  |
| 5.217000000000087 | 46.369 |  |  |
| 5.220000000000087 | 46.524 |  |  |
| 5.223000000000087 | 46.68 |  |  |
| 5.226000000000087 | 46.835 |  |  |
| 5.229000000000087 | 46.992 |  |  |
| 5.232000000000087 | 47.148 |  |  |
| 5.235000000000087 | 47.305 |  |  |
| 5.238000000000087 | 47.462 |  |  |
| 5.241000000000087 | 47.619 |  |  |
| 5.244000000000088 | 47.777 |  |  |
| 5.247000000000088 | 47.935 |  |  |
| 5.250000000000088 | 48.094 |  |  |
| 5.253000000000088 | 48.253 |  |  |
| 5.256000000000088 | 48.412 |  |  |
| 5.259000000000088 | 48.571 |  |  |
| 5.262000000000088 | 48.731 |  |  |
| 5.265000000000088 | 48.891 |  |  |
| 5.268000000000089 | 49.052 |  |  |
| 5.271000000000088 | 49.212 |  |  |
| 5.274000000000089 | 49.373 |  |  |
| 5.277000000000089 | 49.535 |  |  |
| 5.28000000000009 | 49.697 |  |  |
| 5.28300000000009 | 49.859 |  |  |
| 5.28600000000009 | 50.021 |  |  |
| 5.28900000000009 | 50.184 |  |  |
| 5.292000000000089 | 50.347 |  |  |
| 5.29500000000009 | 50.511 |  |  |
| 5.29800000000009 | 50.675 |  |  |
| 5.30100000000009 | 50.839 |  |  |
| 5.30400000000009 | 51.003 |  |  |
| 5.30700000000009 | 51.168 |  |  |
| 5.31000000000009 | 51.333 |  |  |
| 5.31300000000009 | 51.499 |  |  |
| 5.31600000000009 | 51.665 |  |  |
| 5.31900000000009 | 51.831 |  |  |
| 5.322000000000091 | 51.997 |  |  |
| 5.325000000000091 | 52.164 |  |  |
| 5.328000000000091 | 52.332 |  |  |
| 5.331000000000091 | 52.499 |  |  |
| 5.334000000000091 | 52.667 |  |  |
| 5.337000000000091 | 52.835 |  |  |
| 5.340000000000091 | 53.004 |  |  |
| 5.343000000000091 | 53.173 |  |  |
| 5.346000000000092 | 53.342 |  |  |
| 5.349000000000092 | 53.512 |  |  |
| 5.352000000000092 | 53.682 |  |  |
| 5.355000000000092 | 53.852 |  |  |
| 5.358000000000092 | 54.023 |  |  |
| 5.361000000000092 | 54.194 |  |  |
| 5.364000000000092 | 54.365 |  |  |
| 5.367000000000092 | 54.537 |  |  |
| 5.370000000000092 | 54.709 |  |  |
| 5.373000000000093 | 54.881 |  |  |
| 5.376000000000093 | 55.054 |  |  |
| 5.379000000000093 | 55.227 |  |  |
| 5.382000000000093 | 55.4 |  |  |
| 5.385000000000093 | 55.574 |  |  |
| 5.388000000000093 | 55.748 |  |  |
| 5.391000000000093 | 55.923 |  |  |
| 5.394000000000093 | 56.097 |  |  |
| 5.397000000000093 | 56.272 |  |  |
| 5.400000000000094 | 56.448 |  |  |
| 5.403000000000094 | 56.624 |  |  |
| 5.406000000000094 | 56.8 |  |  |
| 5.409000000000094 | 56.977 |  |  |
| 5.412000000000094 | 57.154 |  |  |
| 5.415000000000094 | 57.331 |  |  |
| 5.418000000000094 | 57.508 |  |  |
| 5.421000000000094 | 57.686 |  |  |
| 5.424000000000094 | 57.865 |  |  |
| 5.427000000000095 | 58.043 |  |  |
| 5.430000000000094 | 58.222 |  |  |
| 5.433000000000094 | 58.402 |  |  |
| 5.436000000000094 | 58.581 |  |  |
| 5.439000000000095 | 58.761 |  |  |
| 5.442000000000095 | 58.942 |  |  |
| 5.445000000000095 | 59.123 |  |  |
| 5.448000000000095 | 59.304 |  |  |
| 5.451000000000095 | 59.485 |  |  |
| 5.454000000000096 | 59.667 |  |  |
| 5.457000000000096 | 59.849 |  |  |
| 5.460000000000096 | 60.032 |  |  |
| 5.463000000000096 | 60.215 |  |  |
| 5.466000000000096 | 60.398 |  |  |
| 5.469000000000096 | 60.582 |  |  |
| 5.472000000000096 | 60.766 |  |  |
| 5.475000000000096 | 60.95 |  |  |
| 5.478000000000096 | 61.135 |  |  |
| 5.481000000000096 | 61.32 |  |  |
| 5.484000000000097 | 61.505 |  |  |
| 5.487000000000097 | 61.691 |  |  |
| 5.490000000000097 | 61.877 |  |  |
| 5.493000000000097 | 62.063 |  |  |
| 5.496000000000097 | 62.25 |  |  |
| 5.499000000000097 | 62.438 |  |  |
| 5.502000000000097 | 62.625 |  |  |
| 5.505000000000098 | 62.813 |  |  |
| 5.508000000000098 | 63.001 |  |  |
| 5.511000000000098 | 63.19 |  |  |
| 5.514000000000098 | 63.379 |  |  |
| 5.517000000000098 | 63.568 |  |  |
| 5.520000000000098 | 63.758 |  |  |
| 5.523000000000098 | 63.948 |  |  |
| 5.526000000000098 | 64.139 |  |  |
| 5.529000000000098 | 64.329 |  |  |
| 5.532000000000099 | 64.521 |  |  |
| 5.535000000000099 | 64.712 |  |  |
| 5.538000000000099 | 64.904 |  |  |
| 5.541000000000099 | 65.096 |  |  |
| 5.544000000000099 | 65.289 |  |  |
| 5.547000000000099 | 65.482 |  |  |
| 5.550000000000099 | 65.675 |  |  |
| 5.553000000000099 | 65.869 |  |  |
| 5.5560000000001 | 66.063 |  |  |
| 5.5590000000001 | 66.258 |  |  |
| 5.5620000000001 | 66.452 |  |  |
| 5.5650000000001 | 66.648 |  |  |
| 5.5680000000001 | 66.843 |  |  |
| 5.5710000000001 | 67.039 |  |  |
| 5.5740000000001 | 67.235 |  |  |
| 5.5770000000001 | 67.432 |  |  |
| 5.5800000000001 | 67.629 |  |  |
| 5.5830000000001 | 67.826 |  |  |
| 5.5860000000001 | 68.024 |  |  |
| 5.5890000000001 | 68.222 |  |  |
| 5.592000000000101 | 68.421 |  |  |
| 5.595000000000101 | 68.62 |  |  |
| 5.598000000000101 | 68.819 |  |  |
| 5.601000000000101 | 69.019 |  |  |
| 5.604000000000101 | 69.219 |  |  |
| 5.607000000000101 | 69.419 |  |  |
| 5.610000000000101 | 69.62 |  |  |
| 5.613000000000102 | 69.821 |  |  |
| 5.616000000000102 | 70.022 |  |  |
| 5.619000000000102 | 70.224 |  |  |
| 5.622000000000102 | 70.426 |  |  |
| 5.625000000000102 | 70.629 |  |  |
| 5.628000000000102 | 70.832 |  |  |
| 5.631000000000102 | 71.035 |  |  |
| 5.634000000000102 | 71.239 |  |  |
| 5.637000000000102 | 71.443 |  |  |
| 5.640000000000103 | 71.647 |  |  |
| 5.643000000000103 | 71.852 |  |  |
| 5.646000000000103 | 72.058 |  |  |
| 5.649000000000103 | 72.263 |  |  |
| 5.652000000000103 | 72.469 |  |  |
| 5.655000000000103 | 72.675 |  |  |
| 5.658000000000103 | 72.882 |  |  |
| 5.661000000000103 | 73.089 |  |  |
| 5.664000000000104 | 73.297 |  |  |
| 5.667000000000104 | 73.505 |  |  |
| 5.670000000000104 | 73.713 |  |  |
| 5.673000000000104 | 73.921 |  |  |
| 5.676000000000104 | 74.13 |  |  |
| 5.679000000000104 | 74.34 |  |  |
| 5.682000000000104 | 74.55 |  |  |
| 5.685000000000104 | 74.76 |  |  |
| 5.688000000000104 | 74.97 |  |  |
| 5.691000000000104 | 75.181 |  |  |
| 5.694000000000105 | 75.392 |  |  |
| 5.697000000000105 | 75.604 |  |  |
| 5.700000000000104 | 75.816 |  |  |
| 5.703000000000105 | 76.028 |  |  |
| 5.706000000000105 | 76.241 |  |  |
| 5.709000000000105 | 76.454 |  |  |
| 5.712000000000105 | 76.668 |  |  |
| 5.715000000000105 | 76.882 |  |  |
| 5.718000000000105 | 77.096 |  |  |
| 5.721000000000105 | 77.311 |  |  |
| 5.724000000000106 | 77.526 |  |  |
| 5.727000000000106 | 77.741 |  |  |
| 5.730000000000106 | 77.957 |  |  |
| 5.733000000000106 | 78.174 |  |  |
| 5.736000000000106 | 78.39 |  |  |
| 5.739000000000106 | 78.607 |  |  |
| 5.742000000000106 | 78.825 |  |  |
| 5.745000000000106 | 79.042 |  |  |
| 5.748000000000106 | 79.261 |  |  |
| 5.751000000000106 | 79.479 |  |  |
| 5.754000000000107 | 79.698 |  |  |
| 5.757000000000107 | 79.917 |  |  |
| 5.760000000000107 | 80.137 |  |  |
| 5.763000000000107 | 80.357 |  |  |
| 5.766000000000107 | 80.578 |  |  |
| 5.769000000000107 | 80.799 |  |  |
| 5.772000000000107 | 81.02 |  |  |
| 5.775000000000107 | 81.242 |  |  |
| 5.778000000000107 | 81.464 |  |  |
| 5.781000000000107 | 81.686 |  |  |
| 5.784000000000108 | 81.909 |  |  |
| 5.787000000000108 | 82.132 |  |  |
| 5.790000000000108 | 82.356 |  |  |
| 5.793000000000108 | 82.58 |  |  |
| 5.796000000000108 | 82.804 |  |  |
| 5.799000000000108 | 83.029 |  |  |
| 5.802000000000109 | 83.254 |  |  |
| 5.805000000000109 | 83.48 |  |  |
| 5.80800000000011 | 83.706 |  |  |
| 5.81100000000011 | 83.932 |  |  |
| 5.814000000000109 | 84.159 |  |  |
| 5.817000000000109 | 84.386 |  |  |
| 5.820000000000109 | 84.614 |  |  |
| 5.82300000000011 | 84.841 |  |  |
| 5.82600000000011 | 85.07 |  |  |
| 5.82900000000011 | 85.299 |  |  |
| 5.83200000000011 | 85.528 |  |  |
| 5.83500000000011 | 85.757 |  |  |
| 5.83800000000011 | 85.987 |  |  |
| 5.84100000000011 | 86.217 |  |  |
| 5.84400000000011 | 86.448 |  |  |
| 5.84700000000011 | 86.679 |  |  |
| 5.850000000000111 | 86.911 |  |  |
| 5.853000000000111 | 87.143 |  |  |
| 5.856000000000111 | 87.375 |  |  |
| 5.859000000000111 | 87.608 |  |  |
| 5.862000000000111 | 87.841 |  |  |
| 5.865000000000111 | 88.074 |  |  |
| 5.868000000000111 | 88.308 |  |  |
| 5.871000000000111 | 88.542 |  |  |
| 5.874000000000112 | 88.777 |  |  |
| 5.877000000000112 | 89.012 |  |  |
| 5.880000000000112 | 89.248 |  |  |
| 5.883000000000112 | 89.484 |  |  |
| 5.886000000000112 | 89.72 |  |  |
| 5.889000000000112 | 89.957 |  |  |
| 5.892000000000112 | 90.194 |  |  |
| 5.895000000000112 | 90.431 |  |  |
| 5.898000000000112 | 90.669 |  |  |
| 5.901000000000112 | 90.907 |  |  |
| 5.904000000000113 | 91.146 |  |  |
| 5.907000000000113 | 91.385 |  |  |
| 5.910000000000113 | 91.625 |  |  |
| 5.913000000000113 | 91.865 |  |  |
| 5.916000000000113 | 92.105 |  |  |
| 5.919000000000113 | 92.346 |  |  |
| 5.922000000000113 | 92.587 |  |  |
| 5.925000000000113 | 92.829 |  |  |
| 5.928000000000114 | 93.07 |  |  |
| 5.931000000000113 | 93.313 |  |  |
| 5.934000000000114 | 93.556 |  |  |
| 5.937000000000114 | 93.799 |  |  |
| 5.940000000000114 | 94.042 |  |  |
| 5.943000000000114 | 94.286 |  |  |
| 5.946000000000114 | 94.531 |  |  |
| 5.949000000000114 | 94.776 |  |  |
| 5.952000000000114 | 95.021 |  |  |
| 5.955000000000114 | 95.266 |  |  |
| 5.958000000000114 | 95.512 |  |  |
| 5.961000000000114 | 95.759 |  |  |
| 5.964000000000115 | 96.006 |  |  |
| 5.967000000000115 | 96.253 |  |  |
| 5.970000000000115 | 96.501 |  |  |
| 5.973000000000115 | 96.749 |  |  |
| 5.976000000000115 | 96.997 |  |  |
| 5.979000000000115 | 97.246 |  |  |
| 5.982000000000115 | 97.495 |  |  |
| 5.985000000000115 | 97.745 |  |  |
| 5.988000000000115 | 97.995 |  |  |
| 5.991000000000115 | 98.246 |  |  |
| 5.994000000000116 | 98.497 |  |  |
| 5.997000000000116 | 98.748 |  |  |
| 6.000000000000116 | 99 |  |  |